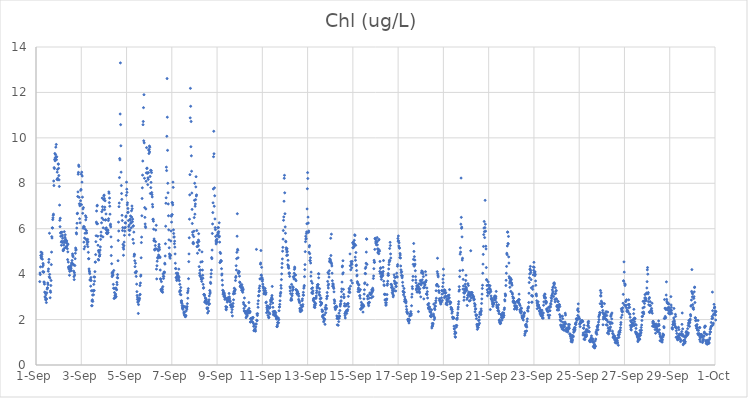
| Category | Chl (ug/L) |
|---|---|
| 44440.166666666664 | 3.67 |
| 44440.177083333336 | 4.05 |
| 44440.1875 | 3.98 |
| 44440.197916666664 | 4.32 |
| 44440.208333333336 | 4.82 |
| 44440.21875 | 4.97 |
| 44440.229166666664 | 4.74 |
| 44440.239583333336 | 4.69 |
| 44440.25 | 4.78 |
| 44440.260416666664 | 4.94 |
| 44440.270833333336 | 4.88 |
| 44440.28125 | 4.66 |
| 44440.291666666664 | 4.33 |
| 44440.302083333336 | 4.11 |
| 44440.3125 | 4.47 |
| 44440.322916666664 | 4.4 |
| 44440.333333333336 | 4.08 |
| 44440.34375 | 4.1 |
| 44440.354166666664 | 3.66 |
| 44440.364583333336 | 3.63 |
| 44440.375 | 3.56 |
| 44440.385416666664 | 3.21 |
| 44440.395833333336 | 3 |
| 44440.40625 | 3.18 |
| 44440.416666666664 | 2.96 |
| 44440.427083333336 | 2.87 |
| 44440.4375 | 3.09 |
| 44440.447916666664 | 2.88 |
| 44440.458333333336 | 2.75 |
| 44440.46875 | 2.91 |
| 44440.479166666664 | 3.18 |
| 44440.489583333336 | 3.34 |
| 44440.5 | 3.39 |
| 44440.510416666664 | 3.4 |
| 44440.520833333336 | 3.61 |
| 44440.53125 | 3.54 |
| 44440.541666666664 | 4.13 |
| 44440.552083333336 | 4.23 |
| 44440.5625 | 4.52 |
| 44440.572916666664 | 4.65 |
| 44440.583333333336 | 3.88 |
| 44440.59375 | 5.8 |
| 44440.604166666664 | 3.99 |
| 44440.614583333336 | 3.83 |
| 44440.625 | 2.96 |
| 44440.635416666664 | 3.26 |
| 44440.645833333336 | 3.2 |
| 44440.65625 | 3.5 |
| 44440.666666666664 | 3.72 |
| 44440.677083333336 | 4.42 |
| 44440.6875 | 4.97 |
| 44440.697916666664 | 5.65 |
| 44440.708333333336 | 5.59 |
| 44440.71875 | 6.04 |
| 44440.729166666664 | 6.03 |
| 44440.739583333336 | 6.4 |
| 44440.75 | 6.48 |
| 44440.760416666664 | 6.59 |
| 44440.770833333336 | 6.64 |
| 44440.78125 | 8.1 |
| 44440.791666666664 | 7.9 |
| 44440.802083333336 | 8.69 |
| 44440.8125 | 8.65 |
| 44440.822916666664 | 9.05 |
| 44440.833333333336 | 9.31 |
| 44440.84375 | 8.99 |
| 44440.854166666664 | 9.13 |
| 44440.864583333336 | 9.26 |
| 44440.875 | 9.59 |
| 44440.885416666664 | 9.14 |
| 44440.895833333336 | 9.71 |
| 44440.90625 | 9.04 |
| 44440.916666666664 | 9.17 |
| 44440.927083333336 | 8.17 |
| 44440.9375 | 8.49 |
| 44440.947916666664 | 8.61 |
| 44440.958333333336 | 8.22 |
| 44440.96875 | 8.15 |
| 44440.979166666664 | 8.85 |
| 44440.989583333336 | 8.84 |
| 44441.0 | 8.66 |
| 44441.010416666664 | 8.34 |
| 44441.020833333336 | 8.15 |
| 44441.03125 | 7.86 |
| 44441.041666666664 | 7.04 |
| 44441.052083333336 | 6.37 |
| 44441.0625 | 6.09 |
| 44441.072916666664 | 6.46 |
| 44441.083333333336 | 5.81 |
| 44441.09375 | 5.67 |
| 44441.104166666664 | 5.84 |
| 44441.114583333336 | 5.41 |
| 44441.125 | 5.27 |
| 44441.135416666664 | 5.45 |
| 44441.145833333336 | 5.85 |
| 44441.15625 | 5.67 |
| 44441.166666666664 | 5.72 |
| 44441.177083333336 | 5.58 |
| 44441.1875 | 5.39 |
| 44441.197916666664 | 5.03 |
| 44441.208333333336 | 5.09 |
| 44441.21875 | 5.05 |
| 44441.229166666664 | 5.28 |
| 44441.239583333336 | 5.46 |
| 44441.25 | 5.87 |
| 44441.260416666664 | 5.14 |
| 44441.270833333336 | 5.39 |
| 44441.28125 | 5.62 |
| 44441.291666666664 | 5.73 |
| 44441.302083333336 | 5.54 |
| 44441.3125 | 5.5 |
| 44441.322916666664 | 5.18 |
| 44441.333333333336 | 5.2 |
| 44441.34375 | 5.43 |
| 44441.354166666664 | 5.47 |
| 44441.364583333336 | 5.36 |
| 44441.375 | 5.25 |
| 44441.385416666664 | 5.12 |
| 44441.395833333336 | 4.64 |
| 44441.40625 | 4.98 |
| 44441.416666666664 | 5.32 |
| 44441.427083333336 | 4.53 |
| 44441.4375 | 4.29 |
| 44441.447916666664 | 4.33 |
| 44441.458333333336 | 4.24 |
| 44441.46875 | 4.21 |
| 44441.479166666664 | 3.95 |
| 44441.489583333336 | 4.12 |
| 44441.5 | 4.29 |
| 44441.510416666664 | 4.17 |
| 44441.520833333336 | 4.23 |
| 44441.53125 | 4.38 |
| 44441.541666666664 | 4.33 |
| 44441.552083333336 | 4.26 |
| 44441.5625 | 4.16 |
| 44441.572916666664 | 4.49 |
| 44441.583333333336 | 4.48 |
| 44441.59375 | 4.6 |
| 44441.604166666664 | 4.45 |
| 44441.614583333336 | 4.89 |
| 44441.625 | 4.82 |
| 44441.635416666664 | 4.77 |
| 44441.645833333336 | 4.44 |
| 44441.65625 | 4.41 |
| 44441.666666666664 | 4.13 |
| 44441.677083333336 | 3.89 |
| 44441.6875 | 3.76 |
| 44441.697916666664 | 4.06 |
| 44441.708333333336 | 3.96 |
| 44441.71875 | 4.38 |
| 44441.729166666664 | 4.68 |
| 44441.739583333336 | 4.92 |
| 44441.75 | 5.15 |
| 44441.760416666664 | 5.05 |
| 44441.770833333336 | 5.09 |
| 44441.78125 | 5.82 |
| 44441.791666666664 | 5.77 |
| 44441.802083333336 | 6.03 |
| 44441.8125 | 6.24 |
| 44441.822916666664 | 6.66 |
| 44441.833333333336 | 6.68 |
| 44441.84375 | 7.42 |
| 44441.854166666664 | 7.62 |
| 44441.864583333336 | 8.4 |
| 44441.875 | 8.48 |
| 44441.885416666664 | 8.8 |
| 44441.895833333336 | 8.74 |
| 44441.90625 | 7.38 |
| 44441.916666666664 | 7.1 |
| 44441.927083333336 | 6.44 |
| 44441.9375 | 7.01 |
| 44441.947916666664 | 6.26 |
| 44441.958333333336 | 7.07 |
| 44441.96875 | 7.23 |
| 44441.979166666664 | 7.69 |
| 44441.989583333336 | 7.73 |
| 44442.0 | 8.4 |
| 44442.010416666664 | 7.06 |
| 44442.020833333336 | 8.49 |
| 44442.03125 | 8.05 |
| 44442.041666666664 | 8.32 |
| 44442.052083333336 | 7.39 |
| 44442.0625 | 6.68 |
| 44442.072916666664 | 6.87 |
| 44442.083333333336 | 6.02 |
| 44442.09375 | 6.93 |
| 44442.104166666664 | 6.1 |
| 44442.114583333336 | 5.41 |
| 44442.125 | 5.11 |
| 44442.135416666664 | 6.08 |
| 44442.145833333336 | 5.59 |
| 44442.15625 | 5.21 |
| 44442.166666666664 | 5.8 |
| 44442.177083333336 | 5.98 |
| 44442.1875 | 6.57 |
| 44442.197916666664 | 6.39 |
| 44442.208333333336 | 5.54 |
| 44442.21875 | 6.5 |
| 44442.229166666664 | 5.91 |
| 44442.239583333336 | 5.81 |
| 44442.25 | 5.47 |
| 44442.260416666664 | 5.31 |
| 44442.270833333336 | 5.39 |
| 44442.28125 | 5.53 |
| 44442.291666666664 | 5.21 |
| 44442.302083333336 | 5.42 |
| 44442.3125 | 4.96 |
| 44442.322916666664 | 4.68 |
| 44442.333333333336 | 4.68 |
| 44442.34375 | 4.23 |
| 44442.354166666664 | 4.14 |
| 44442.364583333336 | 4.1 |
| 44442.375 | 4.02 |
| 44442.385416666664 | 3.75 |
| 44442.395833333336 | 3.73 |
| 44442.40625 | 3.76 |
| 44442.416666666664 | 3.47 |
| 44442.427083333336 | 3.85 |
| 44442.4375 | 3.72 |
| 44442.447916666664 | 3.27 |
| 44442.458333333336 | 2.61 |
| 44442.46875 | 2.82 |
| 44442.479166666664 | 2.61 |
| 44442.489583333336 | 2.87 |
| 44442.5 | 3.08 |
| 44442.510416666664 | 2.8 |
| 44442.520833333336 | 3.28 |
| 44442.53125 | 3.25 |
| 44442.541666666664 | 3.09 |
| 44442.552083333336 | 3.55 |
| 44442.5625 | 3.88 |
| 44442.572916666664 | 3.28 |
| 44442.583333333336 | 3.69 |
| 44442.59375 | 3.87 |
| 44442.604166666664 | 4.11 |
| 44442.614583333336 | 4.53 |
| 44442.625 | 4.53 |
| 44442.635416666664 | 4.86 |
| 44442.645833333336 | 5.43 |
| 44442.65625 | 5.69 |
| 44442.666666666664 | 6.29 |
| 44442.677083333336 | 6.78 |
| 44442.6875 | 6.22 |
| 44442.697916666664 | 7 |
| 44442.708333333336 | 7.03 |
| 44442.71875 | 6.22 |
| 44442.729166666664 | 5.67 |
| 44442.739583333336 | 5.27 |
| 44442.75 | 4.65 |
| 44442.760416666664 | 5.04 |
| 44442.770833333336 | 4.62 |
| 44442.78125 | 4.99 |
| 44442.791666666664 | 4.95 |
| 44442.802083333336 | 4.8 |
| 44442.8125 | 4.8 |
| 44442.822916666664 | 4.86 |
| 44442.833333333336 | 5.06 |
| 44442.84375 | 5.2 |
| 44442.854166666664 | 5.53 |
| 44442.864583333336 | 5.69 |
| 44442.875 | 5.85 |
| 44442.885416666664 | 5.68 |
| 44442.895833333336 | 6.26 |
| 44442.90625 | 6.75 |
| 44442.916666666664 | 6.47 |
| 44442.927083333336 | 7.35 |
| 44442.9375 | 6.97 |
| 44442.947916666664 | 6.84 |
| 44442.958333333336 | 5.64 |
| 44442.96875 | 6.04 |
| 44442.979166666664 | 6.4 |
| 44442.989583333336 | 7.28 |
| 44443.0 | 7.45 |
| 44443.010416666664 | 7.48 |
| 44443.020833333336 | 7.33 |
| 44443.03125 | 6.84 |
| 44443.041666666664 | 6.95 |
| 44443.052083333336 | 7.23 |
| 44443.0625 | 6.38 |
| 44443.072916666664 | 5.99 |
| 44443.083333333336 | 6.39 |
| 44443.09375 | 6.65 |
| 44443.104166666664 | 6.04 |
| 44443.114583333336 | 5.82 |
| 44443.125 | 5.92 |
| 44443.135416666664 | 5.79 |
| 44443.145833333336 | 5.78 |
| 44443.15625 | 5.79 |
| 44443.166666666664 | 5.95 |
| 44443.177083333336 | 5.93 |
| 44443.1875 | 5.83 |
| 44443.197916666664 | 6.36 |
| 44443.208333333336 | 6.44 |
| 44443.21875 | 7.62 |
| 44443.229166666664 | 7.56 |
| 44443.239583333336 | 7.15 |
| 44443.25 | 7.35 |
| 44443.260416666664 | 6.99 |
| 44443.270833333336 | 6.64 |
| 44443.28125 | 6.15 |
| 44443.291666666664 | 6.2 |
| 44443.302083333336 | 6.08 |
| 44443.3125 | 5.64 |
| 44443.322916666664 | 4.82 |
| 44443.333333333336 | 5.2 |
| 44443.34375 | 4.46 |
| 44443.354166666664 | 4.05 |
| 44443.364583333336 | 3.89 |
| 44443.375 | 3.95 |
| 44443.385416666664 | 4.09 |
| 44443.395833333336 | 4.06 |
| 44443.40625 | 3.96 |
| 44443.416666666664 | 3.55 |
| 44443.427083333336 | 3.38 |
| 44443.4375 | 4.16 |
| 44443.447916666664 | 2.93 |
| 44443.458333333336 | 3.37 |
| 44443.46875 | 3.19 |
| 44443.479166666664 | 2.95 |
| 44443.489583333336 | 3.06 |
| 44443.5 | 3.03 |
| 44443.510416666664 | 2.97 |
| 44443.520833333336 | 3.12 |
| 44443.53125 | 3.39 |
| 44443.541666666664 | 3.01 |
| 44443.552083333336 | 3.33 |
| 44443.5625 | 3.31 |
| 44443.572916666664 | 3.64 |
| 44443.583333333336 | 3.54 |
| 44443.59375 | 3.85 |
| 44443.604166666664 | 3.98 |
| 44443.614583333336 | 3.83 |
| 44443.625 | 4.59 |
| 44443.635416666664 | 5.48 |
| 44443.645833333336 | 6.29 |
| 44443.65625 | 5.9 |
| 44443.666666666664 | 6.97 |
| 44443.677083333336 | 7.13 |
| 44443.6875 | 8.25 |
| 44443.697916666664 | 9.09 |
| 44443.708333333336 | 9.03 |
| 44443.71875 | 11.05 |
| 44443.729166666664 | 13.3 |
| 44443.739583333336 | 10.58 |
| 44443.75 | 9.65 |
| 44443.760416666664 | 8.49 |
| 44443.770833333336 | 7.9 |
| 44443.78125 | 7.55 |
| 44443.791666666664 | 7.29 |
| 44443.802083333336 | 6.59 |
| 44443.8125 | 6.36 |
| 44443.822916666664 | 5.92 |
| 44443.833333333336 | 6.05 |
| 44443.84375 | 5.31 |
| 44443.854166666664 | 5.17 |
| 44443.864583333336 | 4.83 |
| 44443.875 | 5.1 |
| 44443.885416666664 | 5.25 |
| 44443.895833333336 | 5.41 |
| 44443.90625 | 5.71 |
| 44443.916666666664 | 6.03 |
| 44443.927083333336 | 5.89 |
| 44443.9375 | 6.26 |
| 44443.947916666664 | 6.06 |
| 44443.958333333336 | 6.25 |
| 44443.96875 | 6.52 |
| 44443.979166666664 | 6.56 |
| 44443.989583333336 | 7.47 |
| 44444.0 | 8.05 |
| 44444.010416666664 | 7.74 |
| 44444.020833333336 | 7.6 |
| 44444.03125 | 7.05 |
| 44444.041666666664 | 7.14 |
| 44444.052083333336 | 6.71 |
| 44444.0625 | 6.89 |
| 44444.072916666664 | 6.73 |
| 44444.083333333336 | 6.36 |
| 44444.09375 | 6.09 |
| 44444.104166666664 | 5.94 |
| 44444.114583333336 | 6.16 |
| 44444.125 | 5.73 |
| 44444.135416666664 | 5.93 |
| 44444.145833333336 | 5.93 |
| 44444.15625 | 6.42 |
| 44444.166666666664 | 6.37 |
| 44444.177083333336 | 6.56 |
| 44444.1875 | 6.24 |
| 44444.197916666664 | 6.26 |
| 44444.208333333336 | 6.04 |
| 44444.21875 | 6.79 |
| 44444.229166666664 | 6.51 |
| 44444.239583333336 | 7 |
| 44444.25 | 6.88 |
| 44444.260416666664 | 6.31 |
| 44444.270833333336 | 6.42 |
| 44444.28125 | 5.53 |
| 44444.291666666664 | 6.11 |
| 44444.302083333336 | 6.13 |
| 44444.3125 | 5.36 |
| 44444.322916666664 | 5.85 |
| 44444.333333333336 | 4.79 |
| 44444.34375 | 4.88 |
| 44444.354166666664 | 4.85 |
| 44444.364583333336 | 4.59 |
| 44444.375 | 4.33 |
| 44444.385416666664 | 4.07 |
| 44444.395833333336 | 4.48 |
| 44444.40625 | 4.06 |
| 44444.416666666664 | 4.1 |
| 44444.427083333336 | 3.9 |
| 44444.4375 | 4.12 |
| 44444.447916666664 | 3.56 |
| 44444.458333333336 | 3.23 |
| 44444.46875 | 3.06 |
| 44444.479166666664 | 2.89 |
| 44444.489583333336 | 2.98 |
| 44444.5 | 2.76 |
| 44444.510416666664 | 2.79 |
| 44444.520833333336 | 2.27 |
| 44444.53125 | 2.66 |
| 44444.541666666664 | 2.83 |
| 44444.552083333336 | 2.86 |
| 44444.5625 | 2.9 |
| 44444.572916666664 | 2.94 |
| 44444.583333333336 | 3.08 |
| 44444.59375 | 3.5 |
| 44444.604166666664 | 3.11 |
| 44444.614583333336 | 3.61 |
| 44444.625 | 3.91 |
| 44444.635416666664 | 3.96 |
| 44444.645833333336 | 4.72 |
| 44444.65625 | 5.39 |
| 44444.666666666664 | 5.63 |
| 44444.677083333336 | 6.57 |
| 44444.6875 | 7.33 |
| 44444.697916666664 | 7.8 |
| 44444.708333333336 | 8.36 |
| 44444.71875 | 8.98 |
| 44444.729166666664 | 10.58 |
| 44444.739583333336 | 10.72 |
| 44444.75 | 11.33 |
| 44444.760416666664 | 9.87 |
| 44444.770833333336 | 11.9 |
| 44444.78125 | 9.78 |
| 44444.791666666664 | 8.22 |
| 44444.802083333336 | 6.93 |
| 44444.8125 | 6.5 |
| 44444.822916666664 | 6.21 |
| 44444.833333333336 | 6.1 |
| 44444.84375 | 6.05 |
| 44444.854166666664 | 6.87 |
| 44444.864583333336 | 8.09 |
| 44444.875 | 8.46 |
| 44444.885416666664 | 9.57 |
| 44444.895833333336 | 8.65 |
| 44444.90625 | 8.67 |
| 44444.916666666664 | 8.45 |
| 44444.927083333336 | 8.45 |
| 44444.9375 | 7.94 |
| 44444.947916666664 | 8.24 |
| 44444.958333333336 | 8.17 |
| 44444.96875 | 8.47 |
| 44444.979166666664 | 9.46 |
| 44444.989583333336 | 9.31 |
| 44445.0 | 9.49 |
| 44445.010416666664 | 9.64 |
| 44445.020833333336 | 9.38 |
| 44445.03125 | 9.59 |
| 44445.041666666664 | 8.3 |
| 44445.052083333336 | 7.55 |
| 44445.0625 | 8.57 |
| 44445.072916666664 | 7.81 |
| 44445.083333333336 | 8.04 |
| 44445.09375 | 8.56 |
| 44445.104166666664 | 8.47 |
| 44445.114583333336 | 7.59 |
| 44445.125 | 7.5 |
| 44445.135416666664 | 7.4 |
| 44445.145833333336 | 7.07 |
| 44445.15625 | 6.96 |
| 44445.166666666664 | 6.41 |
| 44445.177083333336 | 6.42 |
| 44445.1875 | 6.33 |
| 44445.197916666664 | 5.98 |
| 44445.208333333336 | 5.47 |
| 44445.21875 | 5.55 |
| 44445.229166666664 | 5.48 |
| 44445.239583333336 | 5.08 |
| 44445.25 | 5.06 |
| 44445.260416666664 | 5.11 |
| 44445.270833333336 | 5.26 |
| 44445.28125 | 5.43 |
| 44445.291666666664 | 5.94 |
| 44445.302083333336 | 5.12 |
| 44445.3125 | 6.15 |
| 44445.322916666664 | 4.22 |
| 44445.333333333336 | 3.79 |
| 44445.34375 | 4.37 |
| 44445.354166666664 | 4.57 |
| 44445.364583333336 | 5.09 |
| 44445.375 | 4.73 |
| 44445.385416666664 | 4.7 |
| 44445.395833333336 | 4.75 |
| 44445.40625 | 5.03 |
| 44445.416666666664 | 4.84 |
| 44445.427083333336 | 5.22 |
| 44445.4375 | 5.31 |
| 44445.447916666664 | 5.16 |
| 44445.458333333336 | 5.08 |
| 44445.46875 | 4.77 |
| 44445.479166666664 | 4.73 |
| 44445.489583333336 | 4.18 |
| 44445.5 | 3.8 |
| 44445.510416666664 | 3.76 |
| 44445.520833333336 | 3.32 |
| 44445.53125 | 3.3 |
| 44445.541666666664 | 3.67 |
| 44445.552083333336 | 3.24 |
| 44445.5625 | 3.37 |
| 44445.572916666664 | 3.25 |
| 44445.583333333336 | 3.32 |
| 44445.59375 | 3.2 |
| 44445.604166666664 | 3.45 |
| 44445.614583333336 | 4.01 |
| 44445.625 | 3.9 |
| 44445.635416666664 | 3.81 |
| 44445.645833333336 | 3.9 |
| 44445.65625 | 4.09 |
| 44445.666666666664 | 4.05 |
| 44445.677083333336 | 4.09 |
| 44445.6875 | 4.48 |
| 44445.697916666664 | 4.44 |
| 44445.708333333336 | 4.8 |
| 44445.71875 | 5.34 |
| 44445.729166666664 | 6.11 |
| 44445.739583333336 | 7.12 |
| 44445.75 | 7.36 |
| 44445.760416666664 | 8.71 |
| 44445.770833333336 | 8.56 |
| 44445.78125 | 10.07 |
| 44445.791666666664 | 12.61 |
| 44445.802083333336 | 10.91 |
| 44445.8125 | 9.45 |
| 44445.822916666664 | 8 |
| 44445.833333333336 | 7.58 |
| 44445.84375 | 7.09 |
| 44445.854166666664 | 6.57 |
| 44445.864583333336 | 5.95 |
| 44445.875 | 5.51 |
| 44445.885416666664 | 5.16 |
| 44445.895833333336 | 4.89 |
| 44445.90625 | 4.76 |
| 44445.916666666664 | 4.84 |
| 44445.927083333336 | 4.7 |
| 44445.9375 | 4.82 |
| 44445.947916666664 | 4.83 |
| 44445.958333333336 | 5.46 |
| 44445.96875 | 5.9 |
| 44445.979166666664 | 6.55 |
| 44445.989583333336 | 6.29 |
| 44446.0 | 6.61 |
| 44446.010416666664 | 7.15 |
| 44446.020833333336 | 6.62 |
| 44446.03125 | 7.14 |
| 44446.041666666664 | 7.05 |
| 44446.052083333336 | 8.05 |
| 44446.0625 | 7.82 |
| 44446.072916666664 | 5.95 |
| 44446.083333333336 | 5.79 |
| 44446.09375 | 5.63 |
| 44446.104166666664 | 5.64 |
| 44446.114583333336 | 5.34 |
| 44446.125 | 5.45 |
| 44446.135416666664 | 5.19 |
| 44446.145833333336 | 4.89 |
| 44446.15625 | 4.48 |
| 44446.166666666664 | 4.25 |
| 44446.177083333336 | 4.24 |
| 44446.1875 | 3.85 |
| 44446.197916666664 | 4.04 |
| 44446.208333333336 | 3.85 |
| 44446.21875 | 3.72 |
| 44446.229166666664 | 3.76 |
| 44446.239583333336 | 3.92 |
| 44446.25 | 4 |
| 44446.260416666664 | 4.04 |
| 44446.270833333336 | 3.91 |
| 44446.28125 | 3.93 |
| 44446.291666666664 | 3.77 |
| 44446.302083333336 | 3.84 |
| 44446.3125 | 4.22 |
| 44446.322916666664 | 3.87 |
| 44446.333333333336 | 3.71 |
| 44446.34375 | 3.22 |
| 44446.354166666664 | 3.55 |
| 44446.364583333336 | 3.28 |
| 44446.375 | 3.11 |
| 44446.385416666664 | 3.27 |
| 44446.395833333336 | 3.41 |
| 44446.40625 | 3.09 |
| 44446.416666666664 | 2.82 |
| 44446.427083333336 | 2.75 |
| 44446.4375 | 2.82 |
| 44446.447916666664 | 2.71 |
| 44446.458333333336 | 2.61 |
| 44446.46875 | 2.51 |
| 44446.479166666664 | 2.51 |
| 44446.489583333336 | 2.45 |
| 44446.5 | 2.57 |
| 44446.510416666664 | 2.6 |
| 44446.520833333336 | 2.53 |
| 44446.53125 | 2.29 |
| 44446.541666666664 | 2.34 |
| 44446.552083333336 | 2.21 |
| 44446.5625 | 2.31 |
| 44446.572916666664 | 2.19 |
| 44446.583333333336 | 2.57 |
| 44446.59375 | 2.13 |
| 44446.604166666664 | 2.13 |
| 44446.614583333336 | 2.15 |
| 44446.625 | 2.18 |
| 44446.635416666664 | 2.38 |
| 44446.645833333336 | 2.51 |
| 44446.65625 | 2.55 |
| 44446.666666666664 | 2.46 |
| 44446.677083333336 | 2.57 |
| 44446.6875 | 2.7 |
| 44446.697916666664 | 3.18 |
| 44446.708333333336 | 2.94 |
| 44446.71875 | 3.26 |
| 44446.729166666664 | 3.36 |
| 44446.739583333336 | 3.8 |
| 44446.75 | 4.55 |
| 44446.760416666664 | 4.89 |
| 44446.770833333336 | 5.6 |
| 44446.78125 | 6.42 |
| 44446.791666666664 | 7.49 |
| 44446.802083333336 | 8.38 |
| 44446.8125 | 10.88 |
| 44446.822916666664 | 12.18 |
| 44446.833333333336 | 11.39 |
| 44446.84375 | 9.61 |
| 44446.854166666664 | 10.72 |
| 44446.864583333336 | 9.21 |
| 44446.875 | 8.53 |
| 44446.885416666664 | 7.57 |
| 44446.895833333336 | 6.85 |
| 44446.90625 | 6.23 |
| 44446.916666666664 | 5.85 |
| 44446.927083333336 | 5.73 |
| 44446.9375 | 5.36 |
| 44446.947916666664 | 5.4 |
| 44446.958333333336 | 5.34 |
| 44446.96875 | 5.65 |
| 44446.979166666664 | 5.89 |
| 44446.989583333336 | 6.49 |
| 44447.0 | 7.25 |
| 44447.010416666664 | 8 |
| 44447.020833333336 | 6.64 |
| 44447.03125 | 6.99 |
| 44447.041666666664 | 7.09 |
| 44447.052083333336 | 7.28 |
| 44447.0625 | 7.84 |
| 44447.072916666664 | 8.29 |
| 44447.083333333336 | 7.44 |
| 44447.09375 | 7.49 |
| 44447.104166666664 | 5.92 |
| 44447.114583333336 | 5.21 |
| 44447.125 | 5.4 |
| 44447.135416666664 | 4.92 |
| 44447.145833333336 | 5.39 |
| 44447.15625 | 5.23 |
| 44447.166666666664 | 5.26 |
| 44447.177083333336 | 5.5 |
| 44447.1875 | 5.78 |
| 44447.197916666664 | 5.44 |
| 44447.208333333336 | 4.33 |
| 44447.21875 | 5.06 |
| 44447.229166666664 | 4.04 |
| 44447.239583333336 | 3.93 |
| 44447.25 | 4.17 |
| 44447.260416666664 | 3.94 |
| 44447.270833333336 | 4.18 |
| 44447.28125 | 4.53 |
| 44447.291666666664 | 3.86 |
| 44447.302083333336 | 3.78 |
| 44447.3125 | 3.77 |
| 44447.322916666664 | 3.68 |
| 44447.333333333336 | 4.98 |
| 44447.34375 | 4.55 |
| 44447.354166666664 | 4.18 |
| 44447.364583333336 | 3.95 |
| 44447.375 | 3.82 |
| 44447.385416666664 | 3.55 |
| 44447.395833333336 | 3.38 |
| 44447.40625 | 3.41 |
| 44447.416666666664 | 3.1 |
| 44447.427083333336 | 3.11 |
| 44447.4375 | 3.1 |
| 44447.447916666664 | 3.05 |
| 44447.458333333336 | 2.76 |
| 44447.46875 | 2.8 |
| 44447.479166666664 | 2.95 |
| 44447.489583333336 | 2.83 |
| 44447.5 | 2.93 |
| 44447.510416666664 | 2.84 |
| 44447.520833333336 | 2.88 |
| 44447.53125 | 2.7 |
| 44447.541666666664 | 2.73 |
| 44447.552083333336 | 2.51 |
| 44447.5625 | 2.5 |
| 44447.572916666664 | 2.47 |
| 44447.583333333336 | 2.29 |
| 44447.59375 | 2.51 |
| 44447.604166666664 | 2.78 |
| 44447.614583333336 | 2.79 |
| 44447.625 | 2.37 |
| 44447.635416666664 | 2.66 |
| 44447.645833333336 | 2.87 |
| 44447.65625 | 3.04 |
| 44447.666666666664 | 2.7 |
| 44447.677083333336 | 3.28 |
| 44447.6875 | 3.14 |
| 44447.697916666664 | 3.21 |
| 44447.708333333336 | 3.64 |
| 44447.71875 | 3.59 |
| 44447.729166666664 | 3.87 |
| 44447.739583333336 | 4.02 |
| 44447.75 | 4.18 |
| 44447.760416666664 | 4.73 |
| 44447.770833333336 | 4.68 |
| 44447.78125 | 5.06 |
| 44447.791666666664 | 5.79 |
| 44447.802083333336 | 6.21 |
| 44447.8125 | 6.71 |
| 44447.822916666664 | 7.14 |
| 44447.833333333336 | 7.75 |
| 44447.84375 | 9.17 |
| 44447.854166666664 | 10.29 |
| 44447.864583333336 | 9.3 |
| 44447.875 | 6.99 |
| 44447.885416666664 | 7.8 |
| 44447.895833333336 | 7.45 |
| 44447.90625 | 6.43 |
| 44447.916666666664 | 6.05 |
| 44447.927083333336 | 5.96 |
| 44447.9375 | 5.66 |
| 44447.947916666664 | 5.46 |
| 44447.958333333336 | 5.33 |
| 44447.96875 | 5.39 |
| 44447.979166666664 | 5.52 |
| 44447.989583333336 | 5.53 |
| 44448.0 | 5.42 |
| 44448.010416666664 | 5.73 |
| 44448.020833333336 | 5.7 |
| 44448.03125 | 6.04 |
| 44448.041666666664 | 5.83 |
| 44448.052083333336 | 5.78 |
| 44448.0625 | 6.05 |
| 44448.072916666664 | 5.87 |
| 44448.083333333336 | 5.63 |
| 44448.09375 | 6.26 |
| 44448.104166666664 | 5.67 |
| 44448.114583333336 | 5.41 |
| 44448.125 | 4.51 |
| 44448.135416666664 | 4.96 |
| 44448.145833333336 | 4.53 |
| 44448.15625 | 4.91 |
| 44448.166666666664 | 4.6 |
| 44448.177083333336 | 4.57 |
| 44448.1875 | 4.58 |
| 44448.197916666664 | 4.24 |
| 44448.208333333336 | 3.96 |
| 44448.21875 | 4.01 |
| 44448.229166666664 | 3.73 |
| 44448.239583333336 | 3.52 |
| 44448.25 | 3.29 |
| 44448.260416666664 | 3.12 |
| 44448.270833333336 | 3.27 |
| 44448.28125 | 3.19 |
| 44448.291666666664 | 3.2 |
| 44448.302083333336 | 3.02 |
| 44448.3125 | 3.08 |
| 44448.322916666664 | 3.16 |
| 44448.333333333336 | 3.07 |
| 44448.34375 | 2.89 |
| 44448.354166666664 | 2.98 |
| 44448.364583333336 | 2.93 |
| 44448.375 | 2.95 |
| 44448.385416666664 | 2.57 |
| 44448.395833333336 | 2.46 |
| 44448.40625 | 2.43 |
| 44448.416666666664 | 2.55 |
| 44448.427083333336 | 2.54 |
| 44448.4375 | 2.86 |
| 44448.447916666664 | 2.77 |
| 44448.458333333336 | 2.94 |
| 44448.46875 | 2.86 |
| 44448.479166666664 | 2.95 |
| 44448.489583333336 | 2.83 |
| 44448.5 | 2.85 |
| 44448.510416666664 | 2.88 |
| 44448.520833333336 | 2.97 |
| 44448.53125 | 3.15 |
| 44448.541666666664 | 3 |
| 44448.552083333336 | 2.92 |
| 44448.5625 | 2.78 |
| 44448.572916666664 | 2.83 |
| 44448.583333333336 | 2.78 |
| 44448.59375 | 2.63 |
| 44448.604166666664 | 2.64 |
| 44448.614583333336 | 2.61 |
| 44448.625 | 2.54 |
| 44448.635416666664 | 2.66 |
| 44448.645833333336 | 2.32 |
| 44448.65625 | 2.58 |
| 44448.666666666664 | 2.44 |
| 44448.677083333336 | 2.16 |
| 44448.6875 | 2.57 |
| 44448.697916666664 | 2.58 |
| 44448.708333333336 | 2.71 |
| 44448.71875 | 3.13 |
| 44448.729166666664 | 2.87 |
| 44448.739583333336 | 3.17 |
| 44448.75 | 3.24 |
| 44448.760416666664 | 3.38 |
| 44448.770833333336 | 3.25 |
| 44448.78125 | 3.15 |
| 44448.791666666664 | 3.29 |
| 44448.802083333336 | 3.33 |
| 44448.8125 | 3.72 |
| 44448.822916666664 | 3.85 |
| 44448.833333333336 | 3.9 |
| 44448.84375 | 4.37 |
| 44448.854166666664 | 4.18 |
| 44448.864583333336 | 4.68 |
| 44448.875 | 4.96 |
| 44448.885416666664 | 5.67 |
| 44448.895833333336 | 6.66 |
| 44448.90625 | 5.09 |
| 44448.916666666664 | 5.05 |
| 44448.927083333336 | 4.72 |
| 44448.9375 | 4.06 |
| 44448.947916666664 | 4.03 |
| 44448.958333333336 | 4.13 |
| 44448.96875 | 4.09 |
| 44448.979166666664 | 4.1 |
| 44448.989583333336 | 3.91 |
| 44449.0 | 3.65 |
| 44449.010416666664 | 3.63 |
| 44449.020833333336 | 3.46 |
| 44449.03125 | 3.47 |
| 44449.041666666664 | 3.51 |
| 44449.052083333336 | 3.42 |
| 44449.0625 | 3.5 |
| 44449.072916666664 | 3.42 |
| 44449.083333333336 | 3.29 |
| 44449.09375 | 3.54 |
| 44449.104166666664 | 3.37 |
| 44449.114583333336 | 3.27 |
| 44449.125 | 3.42 |
| 44449.135416666664 | 3.2 |
| 44449.145833333336 | 3.3 |
| 44449.15625 | 3.34 |
| 44449.166666666664 | 2.75 |
| 44449.177083333336 | 2.68 |
| 44449.1875 | 2.49 |
| 44449.197916666664 | 2.38 |
| 44449.208333333336 | 2.95 |
| 44449.21875 | 2.36 |
| 44449.229166666664 | 2.35 |
| 44449.239583333336 | 2.61 |
| 44449.25 | 2.59 |
| 44449.260416666664 | 2.27 |
| 44449.270833333336 | 2.36 |
| 44449.28125 | 2.08 |
| 44449.291666666664 | 2.33 |
| 44449.302083333336 | 2.14 |
| 44449.3125 | 2.29 |
| 44449.322916666664 | 2.2 |
| 44449.333333333336 | 2.16 |
| 44449.34375 | 2.27 |
| 44449.354166666664 | 2.41 |
| 44449.364583333336 | 2.28 |
| 44449.375 | 2.38 |
| 44449.385416666664 | 2.37 |
| 44449.395833333336 | 2.39 |
| 44449.40625 | 2.75 |
| 44449.416666666664 | 2.49 |
| 44449.427083333336 | 2.34 |
| 44449.4375 | 2.3 |
| 44449.447916666664 | 2.32 |
| 44449.458333333336 | 2.36 |
| 44449.46875 | 1.89 |
| 44449.479166666664 | 2.04 |
| 44449.489583333336 | 1.9 |
| 44449.5 | 2.05 |
| 44449.510416666664 | 2.01 |
| 44449.520833333336 | 2.03 |
| 44449.53125 | 2.06 |
| 44449.541666666664 | 2 |
| 44449.552083333336 | 2.07 |
| 44449.5625 | 2.08 |
| 44449.572916666664 | 1.89 |
| 44449.583333333336 | 2.08 |
| 44449.59375 | 2.09 |
| 44449.604166666664 | 1.84 |
| 44449.614583333336 | 1.7 |
| 44449.625 | 1.51 |
| 44449.635416666664 | 1.77 |
| 44449.645833333336 | 1.54 |
| 44449.65625 | 1.53 |
| 44449.666666666664 | 1.51 |
| 44449.677083333336 | 1.6 |
| 44449.6875 | 1.55 |
| 44449.697916666664 | 1.49 |
| 44449.708333333336 | 1.68 |
| 44449.71875 | 1.81 |
| 44449.729166666664 | 1.8 |
| 44449.739583333336 | 5.09 |
| 44449.75 | 1.97 |
| 44449.760416666664 | 2.25 |
| 44449.770833333336 | 1.95 |
| 44449.78125 | 2.18 |
| 44449.791666666664 | 2.26 |
| 44449.802083333336 | 2.69 |
| 44449.8125 | 2.54 |
| 44449.822916666664 | 2.83 |
| 44449.833333333336 | 3.04 |
| 44449.84375 | 3.06 |
| 44449.854166666664 | 3.23 |
| 44449.864583333336 | 3.38 |
| 44449.875 | 3.27 |
| 44449.885416666664 | 3.48 |
| 44449.895833333336 | 3.79 |
| 44449.90625 | 3.79 |
| 44449.916666666664 | 4.44 |
| 44449.927083333336 | 4.49 |
| 44449.9375 | 5.04 |
| 44449.947916666664 | 3.95 |
| 44449.958333333336 | 3.96 |
| 44449.96875 | 4.3 |
| 44449.979166666664 | 3.85 |
| 44449.989583333336 | 3.82 |
| 44450.0 | 3.69 |
| 44450.010416666664 | 3.76 |
| 44450.020833333336 | 3.56 |
| 44450.03125 | 3.45 |
| 44450.041666666664 | 3.43 |
| 44450.052083333336 | 3.37 |
| 44450.0625 | 3.28 |
| 44450.072916666664 | 3.13 |
| 44450.083333333336 | 3.14 |
| 44450.09375 | 3.19 |
| 44450.104166666664 | 3.18 |
| 44450.114583333336 | 3.14 |
| 44450.125 | 3.37 |
| 44450.135416666664 | 3.27 |
| 44450.145833333336 | 3.11 |
| 44450.15625 | 2.74 |
| 44450.166666666664 | 3.18 |
| 44450.177083333336 | 2.77 |
| 44450.1875 | 2.3 |
| 44450.197916666664 | 2.52 |
| 44450.208333333336 | 2.61 |
| 44450.21875 | 2.44 |
| 44450.229166666664 | 2.34 |
| 44450.239583333336 | 2.39 |
| 44450.25 | 2.18 |
| 44450.260416666664 | 2.58 |
| 44450.270833333336 | 2.55 |
| 44450.28125 | 2.08 |
| 44450.291666666664 | 2.1 |
| 44450.302083333336 | 2.3 |
| 44450.3125 | 2.51 |
| 44450.322916666664 | 2.51 |
| 44450.333333333336 | 2.25 |
| 44450.34375 | 2.55 |
| 44450.354166666664 | 2.67 |
| 44450.364583333336 | 2.86 |
| 44450.375 | 2.78 |
| 44450.385416666664 | 2.81 |
| 44450.395833333336 | 2.84 |
| 44450.40625 | 2.93 |
| 44450.416666666664 | 2.98 |
| 44450.427083333336 | 3.06 |
| 44450.4375 | 3.46 |
| 44450.447916666664 | 2.9 |
| 44450.458333333336 | 2.73 |
| 44450.46875 | 2.54 |
| 44450.479166666664 | 2.35 |
| 44450.489583333336 | 2.21 |
| 44450.5 | 2.25 |
| 44450.510416666664 | 2.33 |
| 44450.520833333336 | 2.35 |
| 44450.53125 | 2.29 |
| 44450.541666666664 | 2.35 |
| 44450.552083333336 | 2.36 |
| 44450.5625 | 2.16 |
| 44450.572916666664 | 2.19 |
| 44450.583333333336 | 2.19 |
| 44450.59375 | 2.3 |
| 44450.604166666664 | 2.17 |
| 44450.614583333336 | 2.07 |
| 44450.625 | 2.02 |
| 44450.635416666664 | 2.12 |
| 44450.645833333336 | 1.69 |
| 44450.65625 | 1.69 |
| 44450.666666666664 | 1.76 |
| 44450.677083333336 | 1.87 |
| 44450.6875 | 1.86 |
| 44450.697916666664 | 2.01 |
| 44450.708333333336 | 2.07 |
| 44450.71875 | 1.86 |
| 44450.729166666664 | 2 |
| 44450.739583333336 | 2.39 |
| 44450.75 | 2.55 |
| 44450.760416666664 | 2.56 |
| 44450.770833333336 | 2.67 |
| 44450.78125 | 2.83 |
| 44450.791666666664 | 3.04 |
| 44450.802083333336 | 3.14 |
| 44450.8125 | 3.2 |
| 44450.822916666664 | 3.5 |
| 44450.833333333336 | 3.38 |
| 44450.84375 | 3.76 |
| 44450.854166666664 | 4.01 |
| 44450.864583333336 | 4.29 |
| 44450.875 | 4.47 |
| 44450.885416666664 | 4.67 |
| 44450.895833333336 | 5.01 |
| 44450.90625 | 5.18 |
| 44450.916666666664 | 5.54 |
| 44450.927083333336 | 5.92 |
| 44450.9375 | 6.37 |
| 44450.947916666664 | 6.52 |
| 44450.958333333336 | 7.21 |
| 44450.96875 | 8.22 |
| 44450.979166666664 | 8.35 |
| 44450.989583333336 | 7.58 |
| 44451.0 | 6.66 |
| 44451.010416666664 | 6.08 |
| 44451.020833333336 | 5.8 |
| 44451.03125 | 5.45 |
| 44451.041666666664 | 5.42 |
| 44451.052083333336 | 5.16 |
| 44451.0625 | 5.08 |
| 44451.072916666664 | 4.82 |
| 44451.083333333336 | 4.97 |
| 44451.09375 | 5.12 |
| 44451.104166666664 | 5 |
| 44451.114583333336 | 4.84 |
| 44451.125 | 4.41 |
| 44451.135416666664 | 4.61 |
| 44451.145833333336 | 4.31 |
| 44451.15625 | 4.36 |
| 44451.166666666664 | 4.26 |
| 44451.177083333336 | 4.05 |
| 44451.1875 | 4.02 |
| 44451.197916666664 | 4.05 |
| 44451.208333333336 | 3.9 |
| 44451.21875 | 3.44 |
| 44451.229166666664 | 3.26 |
| 44451.239583333336 | 3.39 |
| 44451.25 | 3.14 |
| 44451.260416666664 | 2.85 |
| 44451.270833333336 | 2.87 |
| 44451.28125 | 2.94 |
| 44451.291666666664 | 3.55 |
| 44451.302083333336 | 2.86 |
| 44451.3125 | 3.05 |
| 44451.322916666664 | 3.14 |
| 44451.333333333336 | 3.28 |
| 44451.34375 | 3.45 |
| 44451.354166666664 | 3.32 |
| 44451.364583333336 | 3.41 |
| 44451.375 | 3.89 |
| 44451.385416666664 | 3.87 |
| 44451.395833333336 | 3.79 |
| 44451.40625 | 4.04 |
| 44451.416666666664 | 4.21 |
| 44451.427083333336 | 4.31 |
| 44451.4375 | 4.27 |
| 44451.447916666664 | 3.97 |
| 44451.458333333336 | 3.77 |
| 44451.46875 | 3.96 |
| 44451.479166666664 | 3.32 |
| 44451.489583333336 | 3.71 |
| 44451.5 | 3.3 |
| 44451.510416666664 | 3.29 |
| 44451.520833333336 | 3.15 |
| 44451.53125 | 3.27 |
| 44451.541666666664 | 3.21 |
| 44451.552083333336 | 3.1 |
| 44451.5625 | 3.22 |
| 44451.572916666664 | 3.16 |
| 44451.583333333336 | 3.14 |
| 44451.59375 | 3.13 |
| 44451.604166666664 | 2.89 |
| 44451.614583333336 | 3.03 |
| 44451.625 | 2.83 |
| 44451.635416666664 | 2.79 |
| 44451.645833333336 | 2.74 |
| 44451.65625 | 2.49 |
| 44451.666666666664 | 2.42 |
| 44451.677083333336 | 2.35 |
| 44451.6875 | 2.41 |
| 44451.697916666664 | 2.36 |
| 44451.708333333336 | 2.63 |
| 44451.71875 | 2.51 |
| 44451.729166666664 | 2.42 |
| 44451.739583333336 | 2.4 |
| 44451.75 | 2.58 |
| 44451.760416666664 | 2.83 |
| 44451.770833333336 | 2.91 |
| 44451.78125 | 2.58 |
| 44451.791666666664 | 2.66 |
| 44451.802083333336 | 3.08 |
| 44451.8125 | 3.2 |
| 44451.822916666664 | 3.07 |
| 44451.833333333336 | 3.38 |
| 44451.84375 | 3.44 |
| 44451.854166666664 | 3.5 |
| 44451.864583333336 | 3.89 |
| 44451.875 | 4.2 |
| 44451.885416666664 | 4.42 |
| 44451.895833333336 | 4.99 |
| 44451.90625 | 5.43 |
| 44451.916666666664 | 5.67 |
| 44451.927083333336 | 5.54 |
| 44451.9375 | 5.57 |
| 44451.947916666664 | 5.79 |
| 44451.958333333336 | 5.86 |
| 44451.96875 | 6.22 |
| 44451.979166666664 | 6.87 |
| 44451.989583333336 | 7.76 |
| 44452.0 | 8.47 |
| 44452.010416666664 | 8.21 |
| 44452.020833333336 | 6.51 |
| 44452.03125 | 6.25 |
| 44452.041666666664 | 5.84 |
| 44452.052083333336 | 5.9 |
| 44452.0625 | 4.96 |
| 44452.072916666664 | 5.2 |
| 44452.083333333336 | 5.26 |
| 44452.09375 | 4.9 |
| 44452.104166666664 | 4.6 |
| 44452.114583333336 | 4.59 |
| 44452.125 | 4.72 |
| 44452.135416666664 | 4.49 |
| 44452.145833333336 | 3.91 |
| 44452.15625 | 4.09 |
| 44452.166666666664 | 3.69 |
| 44452.177083333336 | 3.36 |
| 44452.1875 | 3.19 |
| 44452.197916666664 | 3.16 |
| 44452.208333333336 | 3.6 |
| 44452.21875 | 3.4 |
| 44452.229166666664 | 3.15 |
| 44452.239583333336 | 3.26 |
| 44452.25 | 2.86 |
| 44452.260416666664 | 2.83 |
| 44452.270833333336 | 2.93 |
| 44452.28125 | 2.93 |
| 44452.291666666664 | 2.55 |
| 44452.302083333336 | 2.65 |
| 44452.3125 | 2.76 |
| 44452.322916666664 | 2.53 |
| 44452.333333333336 | 2.62 |
| 44452.34375 | 2.71 |
| 44452.354166666664 | 2.7 |
| 44452.364583333336 | 2.93 |
| 44452.375 | 2.96 |
| 44452.385416666664 | 3.04 |
| 44452.395833333336 | 3.18 |
| 44452.40625 | 3.27 |
| 44452.416666666664 | 3.39 |
| 44452.427083333336 | 3.45 |
| 44452.4375 | 3.53 |
| 44452.447916666664 | 3.53 |
| 44452.458333333336 | 3.41 |
| 44452.46875 | 3.54 |
| 44452.479166666664 | 4.02 |
| 44452.489583333336 | 3.84 |
| 44452.5 | 4.01 |
| 44452.510416666664 | 3.11 |
| 44452.520833333336 | 3.21 |
| 44452.53125 | 3.36 |
| 44452.541666666664 | 3.06 |
| 44452.552083333336 | 2.91 |
| 44452.5625 | 2.78 |
| 44452.572916666664 | 2.63 |
| 44452.583333333336 | 2.93 |
| 44452.59375 | 2.95 |
| 44452.604166666664 | 2.67 |
| 44452.614583333336 | 2.73 |
| 44452.625 | 2.73 |
| 44452.635416666664 | 2.43 |
| 44452.645833333336 | 2.35 |
| 44452.65625 | 2.13 |
| 44452.666666666664 | 2.18 |
| 44452.677083333336 | 2.37 |
| 44452.6875 | 2.09 |
| 44452.697916666664 | 2.2 |
| 44452.708333333336 | 1.9 |
| 44452.71875 | 2.04 |
| 44452.729166666664 | 1.94 |
| 44452.739583333336 | 2.01 |
| 44452.75 | 2.21 |
| 44452.760416666664 | 2.01 |
| 44452.770833333336 | 1.79 |
| 44452.78125 | 2.53 |
| 44452.791666666664 | 2.45 |
| 44452.802083333336 | 2.3 |
| 44452.8125 | 2.63 |
| 44452.822916666664 | 2.46 |
| 44452.833333333336 | 2.5 |
| 44452.84375 | 2.92 |
| 44452.854166666664 | 3.01 |
| 44452.864583333336 | 3.19 |
| 44452.875 | 3.04 |
| 44452.885416666664 | 3.68 |
| 44452.895833333336 | 4.07 |
| 44452.90625 | 3.5 |
| 44452.916666666664 | 3.39 |
| 44452.927083333336 | 3.56 |
| 44452.9375 | 4.01 |
| 44452.947916666664 | 3.87 |
| 44452.958333333336 | 4.15 |
| 44452.96875 | 4.56 |
| 44452.979166666664 | 4.68 |
| 44452.989583333336 | 4.62 |
| 44453.0 | 4.52 |
| 44453.010416666664 | 4.62 |
| 44453.020833333336 | 5.58 |
| 44453.03125 | 4.82 |
| 44453.041666666664 | 4.52 |
| 44453.052083333336 | 5.76 |
| 44453.0625 | 4.45 |
| 44453.072916666664 | 4.36 |
| 44453.083333333336 | 4.04 |
| 44453.09375 | 3.71 |
| 44453.104166666664 | 3.47 |
| 44453.114583333336 | 3.57 |
| 44453.125 | 3.57 |
| 44453.135416666664 | 3.52 |
| 44453.145833333336 | 3.43 |
| 44453.15625 | 3.37 |
| 44453.166666666664 | 3.22 |
| 44453.177083333336 | 2.87 |
| 44453.1875 | 2.72 |
| 44453.197916666664 | 2.81 |
| 44453.208333333336 | 2.52 |
| 44453.21875 | 2.56 |
| 44453.229166666664 | 2.44 |
| 44453.239583333336 | 2.51 |
| 44453.25 | 2.55 |
| 44453.260416666664 | 2.58 |
| 44453.270833333336 | 2.59 |
| 44453.28125 | 2.54 |
| 44453.291666666664 | 2.16 |
| 44453.302083333336 | 2.05 |
| 44453.3125 | 1.77 |
| 44453.322916666664 | 2.06 |
| 44453.333333333336 | 2.13 |
| 44453.34375 | 2.04 |
| 44453.354166666664 | 1.75 |
| 44453.364583333336 | 2.08 |
| 44453.375 | 1.91 |
| 44453.385416666664 | 2.28 |
| 44453.395833333336 | 2.06 |
| 44453.40625 | 2.14 |
| 44453.416666666664 | 2.15 |
| 44453.427083333336 | 2.4 |
| 44453.4375 | 2.59 |
| 44453.447916666664 | 2.65 |
| 44453.458333333336 | 2.7 |
| 44453.46875 | 2.8 |
| 44453.479166666664 | 2.83 |
| 44453.489583333336 | 3 |
| 44453.5 | 3.23 |
| 44453.510416666664 | 3.35 |
| 44453.520833333336 | 3.65 |
| 44453.53125 | 4.32 |
| 44453.541666666664 | 4.36 |
| 44453.552083333336 | 4.01 |
| 44453.5625 | 4.59 |
| 44453.572916666664 | 4.06 |
| 44453.583333333336 | 3.33 |
| 44453.59375 | 3.11 |
| 44453.604166666664 | 2.96 |
| 44453.614583333336 | 3 |
| 44453.625 | 2.6 |
| 44453.635416666664 | 2.7 |
| 44453.645833333336 | 2.26 |
| 44453.65625 | 2.17 |
| 44453.666666666664 | 2.07 |
| 44453.677083333336 | 2.32 |
| 44453.6875 | 2.6 |
| 44453.697916666664 | 2.36 |
| 44453.708333333336 | 2.36 |
| 44453.71875 | 2.4 |
| 44453.729166666664 | 2.27 |
| 44453.739583333336 | 2.67 |
| 44453.75 | 2.68 |
| 44453.760416666664 | 2.38 |
| 44453.770833333336 | 2.44 |
| 44453.78125 | 2.69 |
| 44453.791666666664 | 2.71 |
| 44453.802083333336 | 3.02 |
| 44453.8125 | 2.57 |
| 44453.822916666664 | 3.21 |
| 44453.833333333336 | 3.37 |
| 44453.84375 | 3.24 |
| 44453.854166666664 | 3.34 |
| 44453.864583333336 | 3.19 |
| 44453.875 | 4.89 |
| 44453.885416666664 | 4.37 |
| 44453.895833333336 | 3.47 |
| 44453.90625 | 4.19 |
| 44453.916666666664 | 4.55 |
| 44453.927083333336 | 3.72 |
| 44453.9375 | 4.46 |
| 44453.947916666664 | 4.28 |
| 44453.958333333336 | 4.43 |
| 44453.96875 | 4.56 |
| 44453.979166666664 | 3.61 |
| 44453.989583333336 | 5.38 |
| 44454.0 | 5.16 |
| 44454.010416666664 | 5.16 |
| 44454.020833333336 | 5.41 |
| 44454.03125 | 5.32 |
| 44454.041666666664 | 5.29 |
| 44454.052083333336 | 5.2 |
| 44454.0625 | 5.49 |
| 44454.072916666664 | 5.33 |
| 44454.083333333336 | 5.73 |
| 44454.09375 | 5.7 |
| 44454.104166666664 | 4.75 |
| 44454.114583333336 | 4.61 |
| 44454.125 | 5.27 |
| 44454.135416666664 | 4.95 |
| 44454.145833333336 | 4.37 |
| 44454.15625 | 4.4 |
| 44454.166666666664 | 4.16 |
| 44454.177083333336 | 3.92 |
| 44454.1875 | 3.96 |
| 44454.197916666664 | 3.67 |
| 44454.208333333336 | 3.62 |
| 44454.21875 | 3.58 |
| 44454.229166666664 | 3.23 |
| 44454.239583333336 | 3.33 |
| 44454.25 | 3.39 |
| 44454.260416666664 | 3.52 |
| 44454.270833333336 | 3.53 |
| 44454.28125 | 3.23 |
| 44454.291666666664 | 3.29 |
| 44454.302083333336 | 3.04 |
| 44454.3125 | 3.06 |
| 44454.322916666664 | 2.94 |
| 44454.333333333336 | 3.32 |
| 44454.34375 | 2.47 |
| 44454.354166666664 | 2.45 |
| 44454.364583333336 | 2.48 |
| 44454.375 | 2.76 |
| 44454.385416666664 | 2.63 |
| 44454.395833333336 | 2.55 |
| 44454.40625 | 2.68 |
| 44454.416666666664 | 2.61 |
| 44454.427083333336 | 2.52 |
| 44454.4375 | 2.66 |
| 44454.447916666664 | 2.33 |
| 44454.458333333336 | 2.64 |
| 44454.46875 | 2.61 |
| 44454.479166666664 | 2.58 |
| 44454.489583333336 | 2.91 |
| 44454.5 | 3.12 |
| 44454.510416666664 | 3.31 |
| 44454.520833333336 | 3.58 |
| 44454.53125 | 3.62 |
| 44454.541666666664 | 4.03 |
| 44454.552083333336 | 4.25 |
| 44454.5625 | 4.02 |
| 44454.572916666664 | 4.31 |
| 44454.583333333336 | 4.48 |
| 44454.59375 | 4.97 |
| 44454.604166666664 | 5.55 |
| 44454.614583333336 | 5.54 |
| 44454.625 | 4.43 |
| 44454.635416666664 | 3.53 |
| 44454.645833333336 | 3.02 |
| 44454.65625 | 2.91 |
| 44454.666666666664 | 3.06 |
| 44454.677083333336 | 2.73 |
| 44454.6875 | 2.69 |
| 44454.697916666664 | 2.61 |
| 44454.708333333336 | 2.73 |
| 44454.71875 | 2.75 |
| 44454.729166666664 | 2.76 |
| 44454.739583333336 | 2.95 |
| 44454.75 | 3.17 |
| 44454.760416666664 | 3.16 |
| 44454.770833333336 | 3.11 |
| 44454.78125 | 3.13 |
| 44454.791666666664 | 3.13 |
| 44454.802083333336 | 3.1 |
| 44454.8125 | 3.15 |
| 44454.822916666664 | 2.96 |
| 44454.833333333336 | 3.31 |
| 44454.84375 | 3.25 |
| 44454.854166666664 | 3.21 |
| 44454.864583333336 | 3.26 |
| 44454.875 | 3.38 |
| 44454.885416666664 | 3.01 |
| 44454.895833333336 | 3.3 |
| 44454.90625 | 3.81 |
| 44454.916666666664 | 3.92 |
| 44454.927083333336 | 4.24 |
| 44454.9375 | 4.61 |
| 44454.947916666664 | 4.52 |
| 44454.958333333336 | 4.52 |
| 44454.96875 | 5.09 |
| 44454.979166666664 | 5.56 |
| 44454.989583333336 | 5.58 |
| 44455.0 | 5.53 |
| 44455.010416666664 | 5.37 |
| 44455.020833333336 | 5.44 |
| 44455.03125 | 5.42 |
| 44455.041666666664 | 5.29 |
| 44455.052083333336 | 5.43 |
| 44455.0625 | 5.41 |
| 44455.072916666664 | 5.61 |
| 44455.083333333336 | 5.29 |
| 44455.09375 | 5.11 |
| 44455.104166666664 | 4.94 |
| 44455.114583333336 | 5.11 |
| 44455.125 | 5.01 |
| 44455.135416666664 | 5.49 |
| 44455.145833333336 | 4.9 |
| 44455.15625 | 5.53 |
| 44455.166666666664 | 5.06 |
| 44455.177083333336 | 5.01 |
| 44455.1875 | 4.12 |
| 44455.197916666664 | 4.56 |
| 44455.208333333336 | 4.03 |
| 44455.21875 | 4.25 |
| 44455.229166666664 | 4.28 |
| 44455.239583333336 | 3.9 |
| 44455.25 | 4.08 |
| 44455.260416666664 | 3.77 |
| 44455.270833333336 | 3.87 |
| 44455.28125 | 3.96 |
| 44455.291666666664 | 4.07 |
| 44455.302083333336 | 3.98 |
| 44455.3125 | 4.03 |
| 44455.322916666664 | 3.93 |
| 44455.333333333336 | 4.3 |
| 44455.34375 | 4.12 |
| 44455.354166666664 | 4.6 |
| 44455.364583333336 | 3.69 |
| 44455.375 | 3.53 |
| 44455.385416666664 | 3.5 |
| 44455.395833333336 | 3.11 |
| 44455.40625 | 3.11 |
| 44455.416666666664 | 2.86 |
| 44455.427083333336 | 3.11 |
| 44455.4375 | 2.88 |
| 44455.447916666664 | 2.74 |
| 44455.458333333336 | 2.63 |
| 44455.46875 | 2.65 |
| 44455.479166666664 | 2.74 |
| 44455.489583333336 | 2.87 |
| 44455.5 | 2.91 |
| 44455.510416666664 | 3.1 |
| 44455.520833333336 | 3.51 |
| 44455.53125 | 3.58 |
| 44455.541666666664 | 3.69 |
| 44455.552083333336 | 3.95 |
| 44455.5625 | 4.03 |
| 44455.572916666664 | 3.95 |
| 44455.583333333336 | 4.23 |
| 44455.59375 | 4.42 |
| 44455.604166666664 | 4.53 |
| 44455.614583333336 | 4.61 |
| 44455.625 | 5.13 |
| 44455.635416666664 | 4.59 |
| 44455.645833333336 | 5.4 |
| 44455.65625 | 5.26 |
| 44455.666666666664 | 4.89 |
| 44455.677083333336 | 4.71 |
| 44455.6875 | 3.55 |
| 44455.697916666664 | 3.55 |
| 44455.708333333336 | 3.41 |
| 44455.71875 | 3.41 |
| 44455.729166666664 | 3.47 |
| 44455.739583333336 | 3.19 |
| 44455.75 | 3.3 |
| 44455.760416666664 | 3.13 |
| 44455.770833333336 | 3.27 |
| 44455.78125 | 3 |
| 44455.791666666664 | 3.07 |
| 44455.802083333336 | 3.25 |
| 44455.8125 | 3.36 |
| 44455.822916666664 | 3.97 |
| 44455.833333333336 | 3.7 |
| 44455.84375 | 3.87 |
| 44455.854166666664 | 3.58 |
| 44455.864583333336 | 3.64 |
| 44455.875 | 3.85 |
| 44455.885416666664 | 3.58 |
| 44455.895833333336 | 3.26 |
| 44455.90625 | 3.46 |
| 44455.916666666664 | 3.46 |
| 44455.927083333336 | 3.61 |
| 44455.9375 | 4.04 |
| 44455.947916666664 | 3.89 |
| 44455.958333333336 | 3.87 |
| 44455.96875 | 4.35 |
| 44455.979166666664 | 4.42 |
| 44455.989583333336 | 5.57 |
| 44456.0 | 5.45 |
| 44456.010416666664 | 5.68 |
| 44456.020833333336 | 5.47 |
| 44456.03125 | 5.24 |
| 44456.041666666664 | 5.38 |
| 44456.052083333336 | 5.17 |
| 44456.0625 | 5.14 |
| 44456.072916666664 | 4.73 |
| 44456.083333333336 | 4.91 |
| 44456.09375 | 4.84 |
| 44456.104166666664 | 4.71 |
| 44456.114583333336 | 4.36 |
| 44456.125 | 4.19 |
| 44456.135416666664 | 4.07 |
| 44456.145833333336 | 3.94 |
| 44456.15625 | 4.11 |
| 44456.166666666664 | 3.93 |
| 44456.177083333336 | 3.84 |
| 44456.1875 | 3.92 |
| 44456.197916666664 | 3.64 |
| 44456.208333333336 | 3.48 |
| 44456.21875 | 3.25 |
| 44456.229166666664 | 3.23 |
| 44456.239583333336 | 3.09 |
| 44456.25 | 3.19 |
| 44456.260416666664 | 3.37 |
| 44456.270833333336 | 3.2 |
| 44456.28125 | 2.8 |
| 44456.291666666664 | 3 |
| 44456.302083333336 | 2.89 |
| 44456.3125 | 2.89 |
| 44456.322916666664 | 2.79 |
| 44456.333333333336 | 2.83 |
| 44456.34375 | 2.73 |
| 44456.354166666664 | 2.78 |
| 44456.364583333336 | 2.58 |
| 44456.375 | 2.45 |
| 44456.385416666664 | 2.36 |
| 44456.395833333336 | 2.31 |
| 44456.40625 | 2.31 |
| 44456.416666666664 | 2.26 |
| 44456.427083333336 | 1.99 |
| 44456.4375 | 2.02 |
| 44456.447916666664 | 1.94 |
| 44456.458333333336 | 1.94 |
| 44456.46875 | 2.01 |
| 44456.479166666664 | 1.85 |
| 44456.489583333336 | 1.95 |
| 44456.5 | 1.99 |
| 44456.510416666664 | 2.15 |
| 44456.520833333336 | 2.2 |
| 44456.53125 | 2.25 |
| 44456.541666666664 | 2.26 |
| 44456.552083333336 | 2.26 |
| 44456.5625 | 2.35 |
| 44456.572916666664 | 2.19 |
| 44456.583333333336 | 2.25 |
| 44456.59375 | 2.61 |
| 44456.604166666664 | 2.99 |
| 44456.614583333336 | 3.12 |
| 44456.625 | 3.45 |
| 44456.635416666664 | 3.36 |
| 44456.645833333336 | 3.73 |
| 44456.65625 | 3.9 |
| 44456.666666666664 | 4.43 |
| 44456.677083333336 | 4.65 |
| 44456.6875 | 5.35 |
| 44456.697916666664 | 5 |
| 44456.708333333336 | 4.35 |
| 44456.71875 | 4.77 |
| 44456.729166666664 | 4.4 |
| 44456.739583333336 | 4.62 |
| 44456.75 | 4.44 |
| 44456.760416666664 | 4.15 |
| 44456.770833333336 | 3.89 |
| 44456.78125 | 3.74 |
| 44456.791666666664 | 3.62 |
| 44456.802083333336 | 3.31 |
| 44456.8125 | 3.37 |
| 44456.822916666664 | 3.48 |
| 44456.833333333336 | 3.21 |
| 44456.84375 | 3.36 |
| 44456.854166666664 | 3.5 |
| 44456.864583333336 | 3.22 |
| 44456.875 | 3.37 |
| 44456.885416666664 | 3.39 |
| 44456.895833333336 | 2.35 |
| 44456.90625 | 3.45 |
| 44456.916666666664 | 3.57 |
| 44456.927083333336 | 3.31 |
| 44456.9375 | 3.23 |
| 44456.947916666664 | 3.18 |
| 44456.958333333336 | 3.36 |
| 44456.96875 | 3.58 |
| 44456.979166666664 | 3.72 |
| 44456.989583333336 | 3.56 |
| 44457.0 | 3 |
| 44457.010416666664 | 3.69 |
| 44457.020833333336 | 3.53 |
| 44457.03125 | 4.06 |
| 44457.041666666664 | 4.14 |
| 44457.052083333336 | 3.62 |
| 44457.0625 | 3.75 |
| 44457.072916666664 | 4.12 |
| 44457.083333333336 | 4.06 |
| 44457.09375 | 4.02 |
| 44457.104166666664 | 3.62 |
| 44457.114583333336 | 3.89 |
| 44457.125 | 3.4 |
| 44457.135416666664 | 2.91 |
| 44457.145833333336 | 3.62 |
| 44457.15625 | 3.42 |
| 44457.166666666664 | 3.41 |
| 44457.177083333336 | 3.52 |
| 44457.1875 | 3.53 |
| 44457.197916666664 | 3.63 |
| 44457.208333333336 | 4.11 |
| 44457.21875 | 3.66 |
| 44457.229166666664 | 3.96 |
| 44457.239583333336 | 3.72 |
| 44457.25 | 3.13 |
| 44457.260416666664 | 3.13 |
| 44457.270833333336 | 3.39 |
| 44457.28125 | 3.1 |
| 44457.291666666664 | 3.23 |
| 44457.302083333336 | 2.95 |
| 44457.3125 | 2.67 |
| 44457.322916666664 | 2.64 |
| 44457.333333333336 | 2.51 |
| 44457.34375 | 2.52 |
| 44457.354166666664 | 2.71 |
| 44457.364583333336 | 2.45 |
| 44457.375 | 2.54 |
| 44457.385416666664 | 2.56 |
| 44457.395833333336 | 2.47 |
| 44457.40625 | 2.35 |
| 44457.416666666664 | 2.33 |
| 44457.427083333336 | 2.16 |
| 44457.4375 | 2.14 |
| 44457.447916666664 | 2.32 |
| 44457.458333333336 | 2.12 |
| 44457.46875 | 2.23 |
| 44457.479166666664 | 2.43 |
| 44457.489583333336 | 1.63 |
| 44457.5 | 1.7 |
| 44457.510416666664 | 1.83 |
| 44457.520833333336 | 1.72 |
| 44457.53125 | 1.78 |
| 44457.541666666664 | 1.83 |
| 44457.552083333336 | 2.16 |
| 44457.5625 | 2.24 |
| 44457.572916666664 | 2.68 |
| 44457.583333333336 | 2.14 |
| 44457.59375 | 2 |
| 44457.604166666664 | 2.49 |
| 44457.614583333336 | 2.07 |
| 44457.625 | 2.44 |
| 44457.635416666664 | 2.59 |
| 44457.645833333336 | 2.59 |
| 44457.65625 | 2.74 |
| 44457.666666666664 | 2.83 |
| 44457.677083333336 | 3.27 |
| 44457.6875 | 2.94 |
| 44457.697916666664 | 3.49 |
| 44457.708333333336 | 3.54 |
| 44457.71875 | 3.55 |
| 44457.729166666664 | 4.11 |
| 44457.739583333336 | 4.7 |
| 44457.75 | 4.02 |
| 44457.760416666664 | 3.95 |
| 44457.770833333336 | 3.88 |
| 44457.78125 | 3.46 |
| 44457.791666666664 | 3.27 |
| 44457.802083333336 | 3.26 |
| 44457.8125 | 3.19 |
| 44457.822916666664 | 2.92 |
| 44457.833333333336 | 2.85 |
| 44457.84375 | 2.86 |
| 44457.854166666664 | 2.81 |
| 44457.864583333336 | 2.79 |
| 44457.875 | 2.73 |
| 44457.885416666664 | 2.68 |
| 44457.895833333336 | 2.79 |
| 44457.90625 | 2.75 |
| 44457.916666666664 | 2.96 |
| 44457.927083333336 | 3.28 |
| 44457.9375 | 3.12 |
| 44457.947916666664 | 2.84 |
| 44457.958333333336 | 3.26 |
| 44457.96875 | 3.45 |
| 44457.979166666664 | 3.78 |
| 44457.989583333336 | 3.62 |
| 44458.0 | 4.22 |
| 44458.010416666664 | 3.95 |
| 44458.020833333336 | 3.17 |
| 44458.03125 | 3.27 |
| 44458.041666666664 | 3.31 |
| 44458.052083333336 | 2.96 |
| 44458.0625 | 3 |
| 44458.072916666664 | 3.29 |
| 44458.083333333336 | 3.16 |
| 44458.09375 | 3.03 |
| 44458.104166666664 | 3.19 |
| 44458.114583333336 | 2.68 |
| 44458.125 | 2.73 |
| 44458.135416666664 | 3.01 |
| 44458.145833333336 | 2.87 |
| 44458.15625 | 2.82 |
| 44458.166666666664 | 2.65 |
| 44458.177083333336 | 2.91 |
| 44458.1875 | 2.78 |
| 44458.197916666664 | 2.87 |
| 44458.208333333336 | 3.05 |
| 44458.21875 | 3.06 |
| 44458.229166666664 | 2.93 |
| 44458.239583333336 | 2.95 |
| 44458.25 | 3.08 |
| 44458.260416666664 | 2.96 |
| 44458.270833333336 | 3.32 |
| 44458.28125 | 2.79 |
| 44458.291666666664 | 2.69 |
| 44458.302083333336 | 2.77 |
| 44458.3125 | 2.74 |
| 44458.322916666664 | 2.76 |
| 44458.333333333336 | 2.54 |
| 44458.34375 | 2.46 |
| 44458.354166666664 | 2.45 |
| 44458.364583333336 | 2.5 |
| 44458.375 | 2.28 |
| 44458.385416666664 | 2.44 |
| 44458.395833333336 | 2.35 |
| 44458.40625 | 2.11 |
| 44458.416666666664 | 2.1 |
| 44458.427083333336 | 2.04 |
| 44458.4375 | 2.08 |
| 44458.447916666664 | 2.09 |
| 44458.458333333336 | 2.07 |
| 44458.46875 | 1.71 |
| 44458.479166666664 | 1.59 |
| 44458.489583333336 | 1.6 |
| 44458.5 | 1.37 |
| 44458.510416666664 | 1.47 |
| 44458.520833333336 | 1.25 |
| 44458.53125 | 1.22 |
| 44458.541666666664 | 1.41 |
| 44458.552083333336 | 1.41 |
| 44458.5625 | 1.74 |
| 44458.572916666664 | 1.67 |
| 44458.583333333336 | 2.03 |
| 44458.59375 | 1.74 |
| 44458.604166666664 | 2.01 |
| 44458.614583333336 | 2.07 |
| 44458.625 | 2.19 |
| 44458.635416666664 | 2.29 |
| 44458.645833333336 | 2.46 |
| 44458.65625 | 2.55 |
| 44458.666666666664 | 2.68 |
| 44458.677083333336 | 2.79 |
| 44458.6875 | 3.25 |
| 44458.697916666664 | 3.45 |
| 44458.708333333336 | 3.31 |
| 44458.71875 | 3.89 |
| 44458.729166666664 | 4.15 |
| 44458.739583333336 | 4.88 |
| 44458.75 | 5.16 |
| 44458.760416666664 | 4.97 |
| 44458.770833333336 | 6.2 |
| 44458.78125 | 8.23 |
| 44458.791666666664 | 6.5 |
| 44458.802083333336 | 6.02 |
| 44458.8125 | 6.07 |
| 44458.822916666664 | 5.64 |
| 44458.833333333336 | 4.62 |
| 44458.84375 | 4.7 |
| 44458.854166666664 | 4.17 |
| 44458.864583333336 | 3.34 |
| 44458.875 | 3.77 |
| 44458.885416666664 | 3.48 |
| 44458.895833333336 | 3.18 |
| 44458.90625 | 2.85 |
| 44458.916666666664 | 2.99 |
| 44458.927083333336 | 3.16 |
| 44458.9375 | 3.27 |
| 44458.947916666664 | 3.35 |
| 44458.958333333336 | 3.21 |
| 44458.96875 | 3.56 |
| 44458.979166666664 | 3.45 |
| 44458.989583333336 | 3.72 |
| 44459.0 | 3.95 |
| 44459.010416666664 | 3.32 |
| 44459.020833333336 | 3.39 |
| 44459.03125 | 3.28 |
| 44459.041666666664 | 2.89 |
| 44459.052083333336 | 2.62 |
| 44459.0625 | 2.96 |
| 44459.072916666664 | 3.07 |
| 44459.083333333336 | 3.58 |
| 44459.09375 | 3.07 |
| 44459.104166666664 | 3.5 |
| 44459.114583333336 | 3.16 |
| 44459.125 | 3.21 |
| 44459.135416666664 | 3.17 |
| 44459.145833333336 | 2.82 |
| 44459.15625 | 3.14 |
| 44459.166666666664 | 3.03 |
| 44459.177083333336 | 3.05 |
| 44459.1875 | 2.84 |
| 44459.197916666664 | 3.08 |
| 44459.208333333336 | 5.03 |
| 44459.21875 | 3.19 |
| 44459.229166666664 | 2.95 |
| 44459.239583333336 | 3.19 |
| 44459.25 | 3.19 |
| 44459.260416666664 | 3.1 |
| 44459.270833333336 | 3.18 |
| 44459.28125 | 3.09 |
| 44459.291666666664 | 2.99 |
| 44459.302083333336 | 3.04 |
| 44459.3125 | 3.03 |
| 44459.322916666664 | 2.97 |
| 44459.333333333336 | 3.01 |
| 44459.34375 | 2.86 |
| 44459.354166666664 | 2.9 |
| 44459.364583333336 | 2.89 |
| 44459.375 | 2.71 |
| 44459.385416666664 | 2.59 |
| 44459.395833333336 | 2.34 |
| 44459.40625 | 2.65 |
| 44459.416666666664 | 2.45 |
| 44459.427083333336 | 2.48 |
| 44459.4375 | 2.21 |
| 44459.447916666664 | 2.17 |
| 44459.458333333336 | 2.04 |
| 44459.46875 | 2.2 |
| 44459.479166666664 | 1.79 |
| 44459.489583333336 | 1.72 |
| 44459.5 | 1.57 |
| 44459.510416666664 | 1.67 |
| 44459.520833333336 | 1.78 |
| 44459.53125 | 1.77 |
| 44459.541666666664 | 1.65 |
| 44459.552083333336 | 1.96 |
| 44459.5625 | 1.77 |
| 44459.572916666664 | 2.11 |
| 44459.583333333336 | 1.98 |
| 44459.59375 | 1.84 |
| 44459.604166666664 | 2.24 |
| 44459.614583333336 | 2.32 |
| 44459.625 | 2.33 |
| 44459.635416666664 | 2.25 |
| 44459.645833333336 | 2.32 |
| 44459.65625 | 2.22 |
| 44459.666666666664 | 2.47 |
| 44459.677083333336 | 2.38 |
| 44459.6875 | 2.71 |
| 44459.697916666664 | 2.91 |
| 44459.708333333336 | 3.12 |
| 44459.71875 | 3.37 |
| 44459.729166666664 | 3.51 |
| 44459.739583333336 | 4.04 |
| 44459.75 | 4.44 |
| 44459.760416666664 | 4.87 |
| 44459.770833333336 | 5.22 |
| 44459.78125 | 5.74 |
| 44459.791666666664 | 6.03 |
| 44459.802083333336 | 6.32 |
| 44459.8125 | 5.87 |
| 44459.822916666664 | 5.61 |
| 44459.833333333336 | 6.05 |
| 44459.84375 | 7.25 |
| 44459.854166666664 | 6.2 |
| 44459.864583333336 | 5.89 |
| 44459.875 | 5.23 |
| 44459.885416666664 | 5.11 |
| 44459.895833333336 | 4.29 |
| 44459.90625 | 3.76 |
| 44459.916666666664 | 3.74 |
| 44459.927083333336 | 3.5 |
| 44459.9375 | 3.31 |
| 44459.947916666664 | 3.05 |
| 44459.958333333336 | 3.19 |
| 44459.96875 | 3.21 |
| 44459.979166666664 | 3.66 |
| 44459.989583333336 | 3.52 |
| 44460.0 | 3.51 |
| 44460.010416666664 | 3.37 |
| 44460.020833333336 | 3.15 |
| 44460.03125 | 3.19 |
| 44460.041666666664 | 3.36 |
| 44460.052083333336 | 3.36 |
| 44460.0625 | 3.49 |
| 44460.072916666664 | 2.44 |
| 44460.083333333336 | 3.3 |
| 44460.09375 | 3.23 |
| 44460.104166666664 | 3.04 |
| 44460.114583333336 | 2.93 |
| 44460.125 | 2.88 |
| 44460.135416666664 | 2.94 |
| 44460.145833333336 | 2.88 |
| 44460.15625 | 2.81 |
| 44460.166666666664 | 2.73 |
| 44460.177083333336 | 2.67 |
| 44460.1875 | 2.58 |
| 44460.197916666664 | 2.64 |
| 44460.208333333336 | 2.67 |
| 44460.21875 | 2.73 |
| 44460.229166666664 | 2.73 |
| 44460.239583333336 | 2.86 |
| 44460.25 | 2.95 |
| 44460.260416666664 | 3.01 |
| 44460.270833333336 | 3.04 |
| 44460.28125 | 2.95 |
| 44460.291666666664 | 2.86 |
| 44460.302083333336 | 3.03 |
| 44460.3125 | 2.93 |
| 44460.322916666664 | 3 |
| 44460.333333333336 | 3.24 |
| 44460.34375 | 2.76 |
| 44460.354166666664 | 2.64 |
| 44460.364583333336 | 2.56 |
| 44460.375 | 2.52 |
| 44460.385416666664 | 2.53 |
| 44460.395833333336 | 2.55 |
| 44460.40625 | 2.39 |
| 44460.416666666664 | 2.51 |
| 44460.427083333336 | 2.41 |
| 44460.4375 | 2.65 |
| 44460.447916666664 | 2.35 |
| 44460.458333333336 | 2.26 |
| 44460.46875 | 1.95 |
| 44460.479166666664 | 1.99 |
| 44460.489583333336 | 1.88 |
| 44460.5 | 1.86 |
| 44460.510416666664 | 1.82 |
| 44460.520833333336 | 1.9 |
| 44460.53125 | 1.84 |
| 44460.541666666664 | 2.23 |
| 44460.552083333336 | 2.21 |
| 44460.5625 | 2.1 |
| 44460.572916666664 | 2.08 |
| 44460.583333333336 | 2.16 |
| 44460.59375 | 1.98 |
| 44460.604166666664 | 2.1 |
| 44460.614583333336 | 2.3 |
| 44460.625 | 2.11 |
| 44460.635416666664 | 2.21 |
| 44460.645833333336 | 2.2 |
| 44460.65625 | 2.1 |
| 44460.666666666664 | 2.29 |
| 44460.677083333336 | 2.18 |
| 44460.6875 | 2.44 |
| 44460.697916666664 | 2.51 |
| 44460.708333333336 | 2.87 |
| 44460.71875 | 2.82 |
| 44460.729166666664 | 3.13 |
| 44460.739583333336 | 3.04 |
| 44460.75 | 3.08 |
| 44460.760416666664 | 3.5 |
| 44460.770833333336 | 3.73 |
| 44460.78125 | 4.04 |
| 44460.791666666664 | 4.34 |
| 44460.802083333336 | 4.92 |
| 44460.8125 | 4.86 |
| 44460.822916666664 | 5.24 |
| 44460.833333333336 | 5.85 |
| 44460.84375 | 5.85 |
| 44460.854166666664 | 5.35 |
| 44460.864583333336 | 5.33 |
| 44460.875 | 5.66 |
| 44460.885416666664 | 4.76 |
| 44460.895833333336 | 4.49 |
| 44460.90625 | 3.89 |
| 44460.916666666664 | 3.82 |
| 44460.927083333336 | 3.61 |
| 44460.9375 | 3.42 |
| 44460.947916666664 | 3.67 |
| 44460.958333333336 | 3.72 |
| 44460.96875 | 3.82 |
| 44460.979166666664 | 3.24 |
| 44460.989583333336 | 3.78 |
| 44461.0 | 3.75 |
| 44461.010416666664 | 3.62 |
| 44461.020833333336 | 3.56 |
| 44461.03125 | 3.51 |
| 44461.041666666664 | 3.17 |
| 44461.052083333336 | 3.12 |
| 44461.0625 | 3.01 |
| 44461.072916666664 | 2.78 |
| 44461.083333333336 | 2.94 |
| 44461.09375 | 2.83 |
| 44461.104166666664 | 2.94 |
| 44461.114583333336 | 2.73 |
| 44461.125 | 2.79 |
| 44461.135416666664 | 2.46 |
| 44461.145833333336 | 2.6 |
| 44461.15625 | 2.76 |
| 44461.166666666664 | 2.71 |
| 44461.177083333336 | 2.56 |
| 44461.1875 | 2.52 |
| 44461.197916666664 | 2.59 |
| 44461.208333333336 | 2.51 |
| 44461.21875 | 2.52 |
| 44461.229166666664 | 2.6 |
| 44461.239583333336 | 2.45 |
| 44461.25 | 2.53 |
| 44461.260416666664 | 2.79 |
| 44461.270833333336 | 2.81 |
| 44461.28125 | 2.83 |
| 44461.291666666664 | 2.8 |
| 44461.302083333336 | 2.8 |
| 44461.3125 | 2.75 |
| 44461.322916666664 | 2.75 |
| 44461.333333333336 | 2.89 |
| 44461.34375 | 3.12 |
| 44461.354166666664 | 2.87 |
| 44461.364583333336 | 2.68 |
| 44461.375 | 2.43 |
| 44461.385416666664 | 2.62 |
| 44461.395833333336 | 2.35 |
| 44461.40625 | 2.33 |
| 44461.416666666664 | 2.38 |
| 44461.427083333336 | 2.28 |
| 44461.4375 | 2.51 |
| 44461.447916666664 | 2.49 |
| 44461.458333333336 | 2.35 |
| 44461.46875 | 2.16 |
| 44461.479166666664 | 2.08 |
| 44461.489583333336 | 2.11 |
| 44461.5 | 2.04 |
| 44461.510416666664 | 2.11 |
| 44461.520833333336 | 2.11 |
| 44461.53125 | 1.98 |
| 44461.541666666664 | 2.13 |
| 44461.552083333336 | 2.23 |
| 44461.5625 | 2.16 |
| 44461.572916666664 | 2.28 |
| 44461.583333333336 | 2.3 |
| 44461.59375 | 1.31 |
| 44461.604166666664 | 1.38 |
| 44461.614583333336 | 1.48 |
| 44461.625 | 1.76 |
| 44461.635416666664 | 1.47 |
| 44461.645833333336 | 1.7 |
| 44461.65625 | 1.8 |
| 44461.666666666664 | 1.75 |
| 44461.677083333336 | 1.5 |
| 44461.6875 | 1.67 |
| 44461.697916666664 | 1.92 |
| 44461.708333333336 | 2.03 |
| 44461.71875 | 2.4 |
| 44461.729166666664 | 2.5 |
| 44461.739583333336 | 2.37 |
| 44461.75 | 2.51 |
| 44461.760416666664 | 2.56 |
| 44461.770833333336 | 2.75 |
| 44461.78125 | 3.16 |
| 44461.791666666664 | 3.63 |
| 44461.802083333336 | 3.84 |
| 44461.8125 | 4.01 |
| 44461.822916666664 | 4.22 |
| 44461.833333333336 | 4.21 |
| 44461.84375 | 4.34 |
| 44461.854166666664 | 4.15 |
| 44461.864583333336 | 4.07 |
| 44461.875 | 3.76 |
| 44461.885416666664 | 3.4 |
| 44461.895833333336 | 3.06 |
| 44461.90625 | 2.76 |
| 44461.916666666664 | 2.77 |
| 44461.927083333336 | 3.03 |
| 44461.9375 | 3.04 |
| 44461.947916666664 | 3.33 |
| 44461.958333333336 | 3.46 |
| 44461.96875 | 3.97 |
| 44461.979166666664 | 4.32 |
| 44461.989583333336 | 4.17 |
| 44462.0 | 4.52 |
| 44462.010416666664 | 4.3 |
| 44462.020833333336 | 4.08 |
| 44462.03125 | 4.01 |
| 44462.041666666664 | 3.93 |
| 44462.052083333336 | 4.1 |
| 44462.0625 | 3.99 |
| 44462.072916666664 | 3.7 |
| 44462.083333333336 | 3.51 |
| 44462.09375 | 3.1 |
| 44462.104166666664 | 3.13 |
| 44462.114583333336 | 3.04 |
| 44462.125 | 2.83 |
| 44462.135416666664 | 2.73 |
| 44462.145833333336 | 2.48 |
| 44462.15625 | 2.63 |
| 44462.166666666664 | 2.59 |
| 44462.177083333336 | 2.66 |
| 44462.1875 | 2.78 |
| 44462.197916666664 | 2.63 |
| 44462.208333333336 | 2.64 |
| 44462.21875 | 2.56 |
| 44462.229166666664 | 2.51 |
| 44462.239583333336 | 2.38 |
| 44462.25 | 2.51 |
| 44462.260416666664 | 2.34 |
| 44462.270833333336 | 2.25 |
| 44462.28125 | 2.38 |
| 44462.291666666664 | 2.32 |
| 44462.302083333336 | 2.42 |
| 44462.3125 | 2.17 |
| 44462.322916666664 | 2.28 |
| 44462.333333333336 | 2.34 |
| 44462.34375 | 2.17 |
| 44462.354166666664 | 2.41 |
| 44462.364583333336 | 2.24 |
| 44462.375 | 2.07 |
| 44462.385416666664 | 2.18 |
| 44462.395833333336 | 2.08 |
| 44462.40625 | 2.06 |
| 44462.416666666664 | 2.29 |
| 44462.427083333336 | 2.63 |
| 44462.4375 | 2.78 |
| 44462.447916666664 | 3.05 |
| 44462.458333333336 | 3 |
| 44462.46875 | 2.95 |
| 44462.479166666664 | 3.12 |
| 44462.489583333336 | 3.12 |
| 44462.5 | 2.98 |
| 44462.510416666664 | 2.95 |
| 44462.520833333336 | 2.82 |
| 44462.53125 | 2.71 |
| 44462.541666666664 | 2.8 |
| 44462.552083333336 | 2.76 |
| 44462.5625 | 2.46 |
| 44462.572916666664 | 2.47 |
| 44462.583333333336 | 2.41 |
| 44462.59375 | 2.39 |
| 44462.604166666664 | 2.36 |
| 44462.614583333336 | 2.34 |
| 44462.625 | 2.2 |
| 44462.635416666664 | 2.39 |
| 44462.645833333336 | 2.54 |
| 44462.65625 | 2.17 |
| 44462.666666666664 | 2.07 |
| 44462.677083333336 | 2.53 |
| 44462.6875 | 2.39 |
| 44462.697916666664 | 2.19 |
| 44462.708333333336 | 2.39 |
| 44462.71875 | 2.59 |
| 44462.729166666664 | 2.55 |
| 44462.739583333336 | 2.71 |
| 44462.75 | 2.67 |
| 44462.760416666664 | 2.97 |
| 44462.770833333336 | 2.82 |
| 44462.78125 | 2.92 |
| 44462.791666666664 | 3.07 |
| 44462.802083333336 | 3.06 |
| 44462.8125 | 3.31 |
| 44462.822916666664 | 3.16 |
| 44462.833333333336 | 3.41 |
| 44462.84375 | 3.23 |
| 44462.854166666664 | 3.44 |
| 44462.864583333336 | 3.01 |
| 44462.875 | 3.59 |
| 44462.885416666664 | 3.52 |
| 44462.895833333336 | 3.62 |
| 44462.90625 | 3.57 |
| 44462.916666666664 | 3.12 |
| 44462.927083333336 | 2.88 |
| 44462.9375 | 2.78 |
| 44462.947916666664 | 3.4 |
| 44462.958333333336 | 3.15 |
| 44462.96875 | 3.25 |
| 44462.979166666664 | 2.92 |
| 44462.989583333336 | 3.28 |
| 44463.0 | 2.89 |
| 44463.010416666664 | 2.57 |
| 44463.020833333336 | 2.62 |
| 44463.03125 | 2.42 |
| 44463.041666666664 | 2.62 |
| 44463.052083333336 | 2.79 |
| 44463.0625 | 2.51 |
| 44463.072916666664 | 2.8 |
| 44463.083333333336 | 2.56 |
| 44463.09375 | 2.42 |
| 44463.104166666664 | 2.53 |
| 44463.114583333336 | 2.66 |
| 44463.125 | 2.66 |
| 44463.135416666664 | 2.22 |
| 44463.145833333336 | 2.58 |
| 44463.15625 | 1.99 |
| 44463.166666666664 | 2.11 |
| 44463.177083333336 | 1.76 |
| 44463.1875 | 2.15 |
| 44463.197916666664 | 1.93 |
| 44463.208333333336 | 1.7 |
| 44463.21875 | 1.67 |
| 44463.229166666664 | 1.75 |
| 44463.239583333336 | 1.59 |
| 44463.25 | 1.7 |
| 44463.260416666664 | 2.15 |
| 44463.270833333336 | 2.04 |
| 44463.28125 | 1.88 |
| 44463.291666666664 | 1.58 |
| 44463.302083333336 | 1.55 |
| 44463.3125 | 1.66 |
| 44463.322916666664 | 1.77 |
| 44463.333333333336 | 1.53 |
| 44463.34375 | 1.76 |
| 44463.354166666664 | 1.69 |
| 44463.364583333336 | 1.81 |
| 44463.375 | 1.89 |
| 44463.385416666664 | 2.28 |
| 44463.395833333336 | 2.2 |
| 44463.40625 | 1.82 |
| 44463.416666666664 | 1.49 |
| 44463.427083333336 | 1.57 |
| 44463.4375 | 1.61 |
| 44463.447916666664 | 1.52 |
| 44463.458333333336 | 1.62 |
| 44463.46875 | 1.54 |
| 44463.479166666664 | 1.46 |
| 44463.489583333336 | 1.47 |
| 44463.5 | 1.5 |
| 44463.510416666664 | 1.58 |
| 44463.520833333336 | 1.78 |
| 44463.53125 | 1.65 |
| 44463.541666666664 | 1.68 |
| 44463.552083333336 | 1.63 |
| 44463.5625 | 1.61 |
| 44463.572916666664 | 1.78 |
| 44463.583333333336 | 1.37 |
| 44463.59375 | 1.36 |
| 44463.604166666664 | 1.35 |
| 44463.614583333336 | 1.25 |
| 44463.625 | 1.3 |
| 44463.635416666664 | 1.16 |
| 44463.645833333336 | 1.03 |
| 44463.65625 | 1.09 |
| 44463.666666666664 | 1.17 |
| 44463.677083333336 | 1.04 |
| 44463.6875 | 1.01 |
| 44463.697916666664 | 1.3 |
| 44463.708333333336 | 1.1 |
| 44463.71875 | 1.27 |
| 44463.729166666664 | 1.23 |
| 44463.739583333336 | 1.27 |
| 44463.75 | 1.56 |
| 44463.760416666664 | 1.44 |
| 44463.770833333336 | 1.49 |
| 44463.78125 | 1.57 |
| 44463.791666666664 | 1.65 |
| 44463.802083333336 | 1.51 |
| 44463.8125 | 1.56 |
| 44463.822916666664 | 1.64 |
| 44463.833333333336 | 1.8 |
| 44463.84375 | 1.84 |
| 44463.854166666664 | 1.78 |
| 44463.864583333336 | 1.87 |
| 44463.875 | 2.04 |
| 44463.885416666664 | 2.01 |
| 44463.895833333336 | 2.01 |
| 44463.90625 | 1.97 |
| 44463.916666666664 | 2.03 |
| 44463.927083333336 | 2.42 |
| 44463.9375 | 2.18 |
| 44463.947916666664 | 2.48 |
| 44463.958333333336 | 2.69 |
| 44463.96875 | 2.35 |
| 44463.979166666664 | 2.08 |
| 44463.989583333336 | 2.11 |
| 44464.0 | 2.04 |
| 44464.010416666664 | 2.02 |
| 44464.020833333336 | 1.8 |
| 44464.03125 | 1.82 |
| 44464.041666666664 | 1.69 |
| 44464.052083333336 | 1.86 |
| 44464.0625 | 1.91 |
| 44464.072916666664 | 1.85 |
| 44464.083333333336 | 1.87 |
| 44464.09375 | 1.94 |
| 44464.104166666664 | 1.89 |
| 44464.114583333336 | 1.92 |
| 44464.125 | 1.96 |
| 44464.135416666664 | 1.93 |
| 44464.145833333336 | 1.93 |
| 44464.15625 | 1.91 |
| 44464.166666666664 | 1.32 |
| 44464.177083333336 | 1.41 |
| 44464.1875 | 1.62 |
| 44464.197916666664 | 1.62 |
| 44464.208333333336 | 1.14 |
| 44464.21875 | 1.75 |
| 44464.229166666664 | 1.31 |
| 44464.239583333336 | 1.33 |
| 44464.25 | 1.12 |
| 44464.260416666664 | 1.23 |
| 44464.270833333336 | 1.47 |
| 44464.28125 | 1.44 |
| 44464.291666666664 | 1.23 |
| 44464.302083333336 | 1.26 |
| 44464.3125 | 1.56 |
| 44464.322916666664 | 1.34 |
| 44464.333333333336 | 1.28 |
| 44464.34375 | 1.51 |
| 44464.354166666664 | 1.55 |
| 44464.364583333336 | 1.46 |
| 44464.375 | 1.73 |
| 44464.385416666664 | 1.89 |
| 44464.395833333336 | 1.75 |
| 44464.40625 | 1.84 |
| 44464.416666666664 | 1.92 |
| 44464.427083333336 | 1.48 |
| 44464.4375 | 1.65 |
| 44464.447916666664 | 1.46 |
| 44464.458333333336 | 1.08 |
| 44464.46875 | 1.06 |
| 44464.479166666664 | 1.02 |
| 44464.489583333336 | 1.04 |
| 44464.5 | 1.11 |
| 44464.510416666664 | 1.09 |
| 44464.520833333336 | 1.18 |
| 44464.53125 | 1.18 |
| 44464.541666666664 | 1.28 |
| 44464.552083333336 | 1.17 |
| 44464.5625 | 1.13 |
| 44464.572916666664 | 1.11 |
| 44464.583333333336 | 1.02 |
| 44464.59375 | 1.05 |
| 44464.604166666664 | 1.15 |
| 44464.614583333336 | 1.01 |
| 44464.625 | 0.82 |
| 44464.635416666664 | 1 |
| 44464.645833333336 | 0.78 |
| 44464.65625 | 0.83 |
| 44464.666666666664 | 0.88 |
| 44464.677083333336 | 0.91 |
| 44464.6875 | 0.75 |
| 44464.697916666664 | 0.85 |
| 44464.708333333336 | 1.06 |
| 44464.71875 | 0.82 |
| 44464.729166666664 | 1.14 |
| 44464.739583333336 | 1.45 |
| 44464.75 | 1.4 |
| 44464.760416666664 | 1.45 |
| 44464.770833333336 | 1.54 |
| 44464.78125 | 1.35 |
| 44464.791666666664 | 1.69 |
| 44464.802083333336 | 1.57 |
| 44464.8125 | 1.67 |
| 44464.822916666664 | 1.73 |
| 44464.833333333336 | 1.55 |
| 44464.84375 | 1.77 |
| 44464.854166666664 | 1.89 |
| 44464.864583333336 | 2.12 |
| 44464.875 | 2 |
| 44464.885416666664 | 2.19 |
| 44464.895833333336 | 2.22 |
| 44464.90625 | 2.31 |
| 44464.916666666664 | 2.29 |
| 44464.927083333336 | 2.7 |
| 44464.9375 | 3.28 |
| 44464.947916666664 | 3.06 |
| 44464.958333333336 | 3.03 |
| 44464.96875 | 3.18 |
| 44464.979166666664 | 2.81 |
| 44464.989583333336 | 2.67 |
| 44465.0 | 2.57 |
| 44465.010416666664 | 2.58 |
| 44465.020833333336 | 2.74 |
| 44465.03125 | 2.31 |
| 44465.041666666664 | 2.4 |
| 44465.052083333336 | 1.77 |
| 44465.0625 | 2.02 |
| 44465.072916666664 | 2.11 |
| 44465.083333333336 | 2.22 |
| 44465.09375 | 2.26 |
| 44465.104166666664 | 2.13 |
| 44465.114583333336 | 2.7 |
| 44465.125 | 2.06 |
| 44465.135416666664 | 2.26 |
| 44465.145833333336 | 2.15 |
| 44465.15625 | 2.25 |
| 44465.166666666664 | 2.03 |
| 44465.177083333336 | 2.02 |
| 44465.1875 | 2.35 |
| 44465.197916666664 | 1.77 |
| 44465.208333333336 | 1.99 |
| 44465.21875 | 2.18 |
| 44465.229166666664 | 1.97 |
| 44465.239583333336 | 1.75 |
| 44465.25 | 1.41 |
| 44465.260416666664 | 2.33 |
| 44465.270833333336 | 1.89 |
| 44465.28125 | 1.62 |
| 44465.291666666664 | 1.49 |
| 44465.302083333336 | 1.37 |
| 44465.3125 | 1.54 |
| 44465.322916666664 | 1.64 |
| 44465.333333333336 | 1.5 |
| 44465.34375 | 1.5 |
| 44465.354166666664 | 1.89 |
| 44465.364583333336 | 1.58 |
| 44465.375 | 1.81 |
| 44465.385416666664 | 1.67 |
| 44465.395833333336 | 2.14 |
| 44465.40625 | 2.18 |
| 44465.416666666664 | 2.23 |
| 44465.427083333336 | 1.86 |
| 44465.4375 | 2.03 |
| 44465.447916666664 | 2.29 |
| 44465.458333333336 | 1.84 |
| 44465.46875 | 1.49 |
| 44465.479166666664 | 1.39 |
| 44465.489583333336 | 1.37 |
| 44465.5 | 1.21 |
| 44465.510416666664 | 1.25 |
| 44465.520833333336 | 1.21 |
| 44465.53125 | 1.25 |
| 44465.541666666664 | 1.29 |
| 44465.552083333336 | 1.28 |
| 44465.5625 | 1.11 |
| 44465.572916666664 | 1.23 |
| 44465.583333333336 | 1.19 |
| 44465.59375 | 0.99 |
| 44465.604166666664 | 1.1 |
| 44465.614583333336 | 0.99 |
| 44465.625 | 1.03 |
| 44465.635416666664 | 0.96 |
| 44465.645833333336 | 1.05 |
| 44465.65625 | 1.16 |
| 44465.666666666664 | 1.09 |
| 44465.677083333336 | 1.07 |
| 44465.6875 | 1.01 |
| 44465.697916666664 | 0.97 |
| 44465.708333333336 | 1.19 |
| 44465.71875 | 1.31 |
| 44465.729166666664 | 0.87 |
| 44465.739583333336 | 1.35 |
| 44465.75 | 1.45 |
| 44465.760416666664 | 1.22 |
| 44465.770833333336 | 1.34 |
| 44465.78125 | 1.44 |
| 44465.791666666664 | 1.5 |
| 44465.802083333336 | 1.44 |
| 44465.8125 | 1.53 |
| 44465.822916666664 | 1.64 |
| 44465.833333333336 | 1.78 |
| 44465.84375 | 1.87 |
| 44465.854166666664 | 2.09 |
| 44465.864583333336 | 2.48 |
| 44465.875 | 2.38 |
| 44465.885416666664 | 2.45 |
| 44465.895833333336 | 2.2 |
| 44465.90625 | 2.34 |
| 44465.916666666664 | 2.36 |
| 44465.927083333336 | 2.52 |
| 44465.9375 | 2.72 |
| 44465.947916666664 | 3.11 |
| 44465.958333333336 | 3.71 |
| 44465.96875 | 3.69 |
| 44465.979166666664 | 4.54 |
| 44465.989583333336 | 4.09 |
| 44466.0 | 2.64 |
| 44466.010416666664 | 3.58 |
| 44466.020833333336 | 3.5 |
| 44466.03125 | 3.55 |
| 44466.041666666664 | 2.61 |
| 44466.052083333336 | 2.79 |
| 44466.0625 | 2.82 |
| 44466.072916666664 | 2.63 |
| 44466.083333333336 | 2.52 |
| 44466.09375 | 2.87 |
| 44466.104166666664 | 2.37 |
| 44466.114583333336 | 2.42 |
| 44466.125 | 2.37 |
| 44466.135416666664 | 2.36 |
| 44466.145833333336 | 2.34 |
| 44466.15625 | 2.37 |
| 44466.166666666664 | 2.66 |
| 44466.177083333336 | 2.52 |
| 44466.1875 | 2.87 |
| 44466.197916666664 | 2.66 |
| 44466.208333333336 | 2.66 |
| 44466.21875 | 2.26 |
| 44466.229166666664 | 2.54 |
| 44466.239583333336 | 2.23 |
| 44466.25 | 2.1 |
| 44466.260416666664 | 1.74 |
| 44466.270833333336 | 1.94 |
| 44466.28125 | 1.57 |
| 44466.291666666664 | 1.65 |
| 44466.302083333336 | 1.54 |
| 44466.3125 | 1.88 |
| 44466.322916666664 | 1.7 |
| 44466.333333333336 | 1.78 |
| 44466.34375 | 1.97 |
| 44466.354166666664 | 1.82 |
| 44466.364583333336 | 1.75 |
| 44466.375 | 1.99 |
| 44466.385416666664 | 1.84 |
| 44466.395833333336 | 2 |
| 44466.40625 | 2.26 |
| 44466.416666666664 | 2.45 |
| 44466.427083333336 | 1.73 |
| 44466.4375 | 2.07 |
| 44466.447916666664 | 1.91 |
| 44466.458333333336 | 2.03 |
| 44466.46875 | 2.05 |
| 44466.479166666664 | 1.79 |
| 44466.489583333336 | 1.46 |
| 44466.5 | 1.41 |
| 44466.510416666664 | 1.61 |
| 44466.520833333336 | 1.76 |
| 44466.53125 | 1.36 |
| 44466.541666666664 | 1.42 |
| 44466.552083333336 | 1.33 |
| 44466.5625 | 1.28 |
| 44466.572916666664 | 1.25 |
| 44466.583333333336 | 1.2 |
| 44466.59375 | 1.03 |
| 44466.604166666664 | 1.07 |
| 44466.614583333336 | 1.12 |
| 44466.625 | 1.13 |
| 44466.635416666664 | 1.35 |
| 44466.645833333336 | 1.32 |
| 44466.65625 | 1.25 |
| 44466.666666666664 | 1.13 |
| 44466.677083333336 | 1.14 |
| 44466.6875 | 1.52 |
| 44466.697916666664 | 1.38 |
| 44466.708333333336 | 1.31 |
| 44466.71875 | 1.4 |
| 44466.729166666664 | 1.43 |
| 44466.739583333336 | 1.65 |
| 44466.75 | 1.53 |
| 44466.760416666664 | 1.76 |
| 44466.770833333336 | 1.96 |
| 44466.78125 | 2.13 |
| 44466.791666666664 | 2.31 |
| 44466.802083333336 | 2.15 |
| 44466.8125 | 2.51 |
| 44466.822916666664 | 2.8 |
| 44466.833333333336 | 2.29 |
| 44466.84375 | 2.33 |
| 44466.854166666664 | 2.25 |
| 44466.864583333336 | 2.82 |
| 44466.875 | 2.55 |
| 44466.885416666664 | 2.71 |
| 44466.895833333336 | 2.95 |
| 44466.90625 | 3.1 |
| 44466.916666666664 | 2.83 |
| 44466.927083333336 | 2.96 |
| 44466.9375 | 2.86 |
| 44466.947916666664 | 2.9 |
| 44466.958333333336 | 2.84 |
| 44466.96875 | 3.14 |
| 44466.979166666664 | 3.17 |
| 44466.989583333336 | 3.39 |
| 44467.0 | 3.67 |
| 44467.010416666664 | 4.19 |
| 44467.020833333336 | 4.29 |
| 44467.03125 | 4 |
| 44467.041666666664 | 3.13 |
| 44467.052083333336 | 3.19 |
| 44467.0625 | 2.79 |
| 44467.072916666664 | 2.65 |
| 44467.083333333336 | 2.92 |
| 44467.09375 | 2.33 |
| 44467.104166666664 | 2.97 |
| 44467.114583333336 | 2.31 |
| 44467.125 | 2.62 |
| 44467.135416666664 | 2.79 |
| 44467.145833333336 | 2.61 |
| 44467.15625 | 2.38 |
| 44467.166666666664 | 2.37 |
| 44467.177083333336 | 2.42 |
| 44467.1875 | 2.35 |
| 44467.197916666664 | 2.49 |
| 44467.208333333336 | 2.38 |
| 44467.21875 | 2.72 |
| 44467.229166666664 | 2.28 |
| 44467.239583333336 | 1.71 |
| 44467.25 | 1.85 |
| 44467.260416666664 | 1.91 |
| 44467.270833333336 | 1.92 |
| 44467.28125 | 1.72 |
| 44467.291666666664 | 1.73 |
| 44467.302083333336 | 1.78 |
| 44467.3125 | 1.68 |
| 44467.322916666664 | 1.73 |
| 44467.333333333336 | 1.82 |
| 44467.34375 | 1.79 |
| 44467.354166666664 | 1.56 |
| 44467.364583333336 | 1.7 |
| 44467.375 | 1.4 |
| 44467.385416666664 | 1.67 |
| 44467.395833333336 | 1.76 |
| 44467.40625 | 1.68 |
| 44467.416666666664 | 1.8 |
| 44467.427083333336 | 1.68 |
| 44467.4375 | 1.59 |
| 44467.447916666664 | 1.54 |
| 44467.458333333336 | 1.48 |
| 44467.46875 | 1.47 |
| 44467.479166666664 | 1.48 |
| 44467.489583333336 | 1.73 |
| 44467.5 | 1.73 |
| 44467.510416666664 | 1.94 |
| 44467.520833333336 | 1.8 |
| 44467.53125 | 1.75 |
| 44467.541666666664 | 1.55 |
| 44467.552083333336 | 1.41 |
| 44467.5625 | 1.34 |
| 44467.572916666664 | 1.07 |
| 44467.583333333336 | 1.26 |
| 44467.59375 | 1.25 |
| 44467.604166666664 | 1.23 |
| 44467.614583333336 | 1.07 |
| 44467.625 | 1.17 |
| 44467.635416666664 | 1.03 |
| 44467.645833333336 | 1.08 |
| 44467.65625 | 1.2 |
| 44467.666666666664 | 1.01 |
| 44467.677083333336 | 1.11 |
| 44467.6875 | 1.28 |
| 44467.697916666664 | 1.37 |
| 44467.708333333336 | 1.24 |
| 44467.71875 | 1.33 |
| 44467.729166666664 | 1.32 |
| 44467.739583333336 | 1.69 |
| 44467.75 | 1.64 |
| 44467.760416666664 | 2.05 |
| 44467.770833333336 | 2.88 |
| 44467.78125 | 2.05 |
| 44467.791666666664 | 2.5 |
| 44467.802083333336 | 2.14 |
| 44467.8125 | 2.49 |
| 44467.822916666664 | 2.08 |
| 44467.833333333336 | 2.44 |
| 44467.84375 | 3.08 |
| 44467.854166666664 | 3.66 |
| 44467.864583333336 | 2.89 |
| 44467.875 | 2.8 |
| 44467.885416666664 | 2.76 |
| 44467.895833333336 | 2.72 |
| 44467.90625 | 2.51 |
| 44467.916666666664 | 2.42 |
| 44467.927083333336 | 2.71 |
| 44467.9375 | 2.69 |
| 44467.947916666664 | 2.28 |
| 44467.958333333336 | 2.54 |
| 44467.96875 | 2.69 |
| 44467.979166666664 | 2.49 |
| 44467.989583333336 | 2.36 |
| 44468.0 | 2.25 |
| 44468.010416666664 | 2.38 |
| 44468.020833333336 | 2.25 |
| 44468.03125 | 2.32 |
| 44468.041666666664 | 2.43 |
| 44468.052083333336 | 3.01 |
| 44468.0625 | 2.64 |
| 44468.072916666664 | 2.54 |
| 44468.083333333336 | 2.4 |
| 44468.09375 | 2.27 |
| 44468.104166666664 | 1.62 |
| 44468.114583333336 | 1.65 |
| 44468.125 | 1.58 |
| 44468.135416666664 | 1.78 |
| 44468.145833333336 | 1.9 |
| 44468.15625 | 1.8 |
| 44468.166666666664 | 1.78 |
| 44468.177083333336 | 2.07 |
| 44468.1875 | 2.49 |
| 44468.197916666664 | 1.97 |
| 44468.208333333336 | 1.9 |
| 44468.21875 | 1.82 |
| 44468.229166666664 | 1.75 |
| 44468.239583333336 | 1.67 |
| 44468.25 | 2.23 |
| 44468.260416666664 | 2.14 |
| 44468.270833333336 | 1.66 |
| 44468.28125 | 1.22 |
| 44468.291666666664 | 1.51 |
| 44468.302083333336 | 1.62 |
| 44468.3125 | 1.39 |
| 44468.322916666664 | 1.2 |
| 44468.333333333336 | 1.25 |
| 44468.34375 | 1.11 |
| 44468.354166666664 | 1.14 |
| 44468.364583333336 | 1.22 |
| 44468.375 | 1.13 |
| 44468.385416666664 | 1.66 |
| 44468.395833333336 | 1.3 |
| 44468.40625 | 1.56 |
| 44468.416666666664 | 1.35 |
| 44468.427083333336 | 1.22 |
| 44468.4375 | 1.36 |
| 44468.447916666664 | 1.34 |
| 44468.458333333336 | 1.36 |
| 44468.46875 | 1.14 |
| 44468.479166666664 | 1.03 |
| 44468.489583333336 | 1.09 |
| 44468.5 | 1.35 |
| 44468.510416666664 | 1.38 |
| 44468.520833333336 | 1.34 |
| 44468.53125 | 1.47 |
| 44468.541666666664 | 1.79 |
| 44468.552083333336 | 2.29 |
| 44468.5625 | 1.28 |
| 44468.572916666664 | 1.59 |
| 44468.583333333336 | 1.34 |
| 44468.59375 | 0.89 |
| 44468.604166666664 | 1.07 |
| 44468.614583333336 | 0.94 |
| 44468.625 | 1.08 |
| 44468.635416666664 | 0.96 |
| 44468.645833333336 | 1.24 |
| 44468.65625 | 1.11 |
| 44468.666666666664 | 1.25 |
| 44468.677083333336 | 0.97 |
| 44468.6875 | 1.03 |
| 44468.697916666664 | 1.21 |
| 44468.708333333336 | 1.28 |
| 44468.71875 | 1.44 |
| 44468.729166666664 | 1.28 |
| 44468.739583333336 | 1.48 |
| 44468.75 | 1.37 |
| 44468.760416666664 | 1.32 |
| 44468.770833333336 | 1.3 |
| 44468.78125 | 1.41 |
| 44468.791666666664 | 1.6 |
| 44468.802083333336 | 1.35 |
| 44468.8125 | 1.74 |
| 44468.822916666664 | 1.41 |
| 44468.833333333336 | 1.85 |
| 44468.84375 | 1.96 |
| 44468.854166666664 | 1.82 |
| 44468.864583333336 | 1.87 |
| 44468.875 | 1.7 |
| 44468.885416666664 | 1.87 |
| 44468.895833333336 | 1.96 |
| 44468.90625 | 2.02 |
| 44468.916666666664 | 2.22 |
| 44468.927083333336 | 2.16 |
| 44468.9375 | 2.59 |
| 44468.947916666664 | 2.62 |
| 44468.958333333336 | 2.86 |
| 44468.96875 | 3.24 |
| 44468.979166666664 | 4.2 |
| 44468.989583333336 | 3.18 |
| 44469.0 | 3 |
| 44469.010416666664 | 3.13 |
| 44469.020833333336 | 2.66 |
| 44469.03125 | 2.5 |
| 44469.041666666664 | 2.53 |
| 44469.052083333336 | 2.45 |
| 44469.0625 | 2.93 |
| 44469.072916666664 | 3.01 |
| 44469.083333333336 | 3.22 |
| 44469.09375 | 3.41 |
| 44469.104166666664 | 3.43 |
| 44469.114583333336 | 2.75 |
| 44469.125 | 2.08 |
| 44469.135416666664 | 2.07 |
| 44469.145833333336 | 1.95 |
| 44469.15625 | 1.73 |
| 44469.166666666664 | 1.97 |
| 44469.177083333336 | 1.72 |
| 44469.1875 | 1.62 |
| 44469.197916666664 | 1.63 |
| 44469.208333333336 | 1.78 |
| 44469.21875 | 1.54 |
| 44469.229166666664 | 1.65 |
| 44469.239583333336 | 1.38 |
| 44469.25 | 1.96 |
| 44469.260416666664 | 1.35 |
| 44469.270833333336 | 1.52 |
| 44469.28125 | 1.31 |
| 44469.291666666664 | 1.37 |
| 44469.302083333336 | 1.38 |
| 44469.3125 | 1.64 |
| 44469.322916666664 | 1.12 |
| 44469.333333333336 | 1.65 |
| 44469.34375 | 1.22 |
| 44469.354166666664 | 1.03 |
| 44469.364583333336 | 1.25 |
| 44469.375 | 1.21 |
| 44469.385416666664 | 1.35 |
| 44469.395833333336 | 1.27 |
| 44469.40625 | 1.34 |
| 44469.416666666664 | 1.25 |
| 44469.427083333336 | 1.25 |
| 44469.4375 | 1.23 |
| 44469.447916666664 | 0.99 |
| 44469.458333333336 | 1.1 |
| 44469.46875 | 1.07 |
| 44469.479166666664 | 1.1 |
| 44469.489583333336 | 1.13 |
| 44469.5 | 1.28 |
| 44469.510416666664 | 1.26 |
| 44469.520833333336 | 1.41 |
| 44469.53125 | 1.45 |
| 44469.541666666664 | 1.65 |
| 44469.552083333336 | 1.71 |
| 44469.5625 | 1.7 |
| 44469.572916666664 | 1.71 |
| 44469.583333333336 | 1.37 |
| 44469.59375 | 1.03 |
| 44469.604166666664 | 1.08 |
| 44469.614583333336 | 0.95 |
| 44469.625 | 1.35 |
| 44469.635416666664 | 1.34 |
| 44469.645833333336 | 0.92 |
| 44469.65625 | 0.95 |
| 44469.666666666664 | 0.92 |
| 44469.677083333336 | 1.09 |
| 44469.6875 | 0.96 |
| 44469.697916666664 | 0.96 |
| 44469.708333333336 | 1.03 |
| 44469.71875 | 0.95 |
| 44469.729166666664 | 0.96 |
| 44469.739583333336 | 0.98 |
| 44469.75 | 1.12 |
| 44469.760416666664 | 1.36 |
| 44469.770833333336 | 1.19 |
| 44469.78125 | 1.46 |
| 44469.791666666664 | 1.57 |
| 44469.802083333336 | 1.45 |
| 44469.8125 | 1.63 |
| 44469.822916666664 | 1.68 |
| 44469.833333333336 | 1.87 |
| 44469.84375 | 1.71 |
| 44469.854166666664 | 1.72 |
| 44469.864583333336 | 2.04 |
| 44469.875 | 2.14 |
| 44469.885416666664 | 3.21 |
| 44469.895833333336 | 2.39 |
| 44469.90625 | 2.06 |
| 44469.916666666664 | 1.77 |
| 44469.927083333336 | 1.84 |
| 44469.9375 | 2.23 |
| 44469.947916666664 | 2.23 |
| 44469.958333333336 | 2.67 |
| 44469.96875 | 2.51 |
| 44469.979166666664 | 2.53 |
| 44469.989583333336 | 2.55 |
| 44470.0 | 2.3 |
| 44470.010416666664 | 2.38 |
| 44470.020833333336 | 2.2 |
| 44470.03125 | 1.98 |
| 44470.041666666664 | 2.35 |
| 44470.052083333336 | 2.39 |
| 44470.0625 | 2.57 |
| 44470.072916666664 | 2.32 |
| 44470.083333333336 | 2.25 |
| 44470.09375 | 2.62 |
| 44470.104166666664 | 2.45 |
| 44470.114583333336 | 2.87 |
| 44470.125 | 2.83 |
| 44470.135416666664 | 2.49 |
| 44470.145833333336 | 2.28 |
| 44470.15625 | 2.31 |